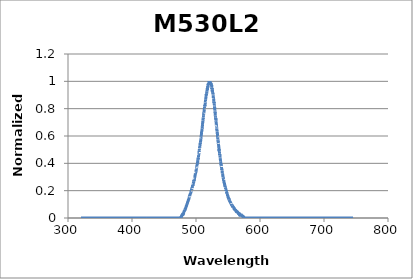
| Category | Normalized Intensity |
|---|---|
| 320.14817633 | 0 |
| 320.25686297 | 0 |
| 320.36555585 | 0 |
| 320.47425497 | 0 |
| 320.58296033 | 0 |
| 320.69167192 | 0 |
| 320.80038974 | 0 |
| 320.9091138 | 0 |
| 321.01784408 | 0 |
| 321.12658059 | 0 |
| 321.23532333 | 0 |
| 321.3440723 | 0 |
| 321.45282748 | 0 |
| 321.56158889 | 0 |
| 321.67035652 | 0 |
| 321.77913037 | 0 |
| 321.88791044 | 0 |
| 321.99669672 | 0 |
| 322.10548922 | 0 |
| 322.21428793 | 0 |
| 322.32309285 | 0 |
| 322.43190398 | 0 |
| 322.54072132 | 0 |
| 322.64954486 | 0 |
| 322.75837461 | 0 |
| 322.86721057 | 0 |
| 322.97605272 | 0 |
| 323.08490108 | 0 |
| 323.19375563 | 0 |
| 323.30261639 | 0 |
| 323.41148333 | 0 |
| 323.52035648 | 0 |
| 323.62923581 | 0 |
| 323.73812134 | 0 |
| 323.84701305 | 0 |
| 323.95591096 | 0 |
| 324.06481505 | 0 |
| 324.17372533 | 0 |
| 324.28264178 | 0 |
| 324.39156443 | 0 |
| 324.50049325 | 0 |
| 324.60942825 | 0 |
| 324.71836943 | 0 |
| 324.82731678 | 0 |
| 324.93627031 | 0 |
| 325.04523001 | 0 |
| 325.15419588 | 0 |
| 325.26316792 | 0 |
| 325.37214613 | 0 |
| 325.48113051 | 0 |
| 325.59012105 | 0 |
| 325.69911775 | 0 |
| 325.80812062 | 0 |
| 325.91712964 | 0 |
| 326.02614483 | 0 |
| 326.13516617 | 0 |
| 326.24419367 | 0 |
| 326.35322732 | 0 |
| 326.46226713 | 0 |
| 326.57131308 | 0 |
| 326.68036519 | 0 |
| 326.78942344 | 0 |
| 326.89848784 | 0 |
| 327.00755839 | 0 |
| 327.11663508 | 0 |
| 327.22571791 | 0 |
| 327.33480688 | 0 |
| 327.44390199 | 0 |
| 327.55300323 | 0 |
| 327.66211061 | 0 |
| 327.77122413 | 0 |
| 327.88034378 | 0 |
| 327.98946956 | 0 |
| 328.09860147 | 0 |
| 328.20773951 | 0 |
| 328.31688367 | 0 |
| 328.42603396 | 0 |
| 328.53519037 | 0 |
| 328.6443529 | 0 |
| 328.75352156 | 0 |
| 328.86269633 | 0 |
| 328.97187722 | 0 |
| 329.08106423 | 0 |
| 329.19025735 | 0 |
| 329.29945658 | 0 |
| 329.40866192 | 0 |
| 329.51787337 | 0 |
| 329.62709093 | 0 |
| 329.7363146 | 0 |
| 329.84554437 | 0 |
| 329.95478025 | 0 |
| 330.06402222 | 0 |
| 330.1732703 | 0 |
| 330.28252448 | 0 |
| 330.39178475 | 0 |
| 330.50105112 | 0 |
| 330.61032358 | 0 |
| 330.71960213 | 0 |
| 330.82888678 | 0 |
| 330.93817751 | 0 |
| 331.04747434 | 0 |
| 331.15677725 | 0 |
| 331.26608624 | 0 |
| 331.37540132 | 0 |
| 331.48472248 | 0 |
| 331.59404972 | 0 |
| 331.70338303 | 0 |
| 331.81272243 | 0 |
| 331.9220679 | 0 |
| 332.03141944 | 0 |
| 332.14077706 | 0 |
| 332.25014075 | 0 |
| 332.3595105 | 0 |
| 332.46888633 | 0 |
| 332.57826822 | 0 |
| 332.68765617 | 0 |
| 332.79705019 | 0 |
| 332.90645027 | 0 |
| 333.01585641 | 0 |
| 333.12526861 | 0 |
| 333.23468687 | 0 |
| 333.34411118 | 0 |
| 333.45354155 | 0 |
| 333.56297796 | 0 |
| 333.67242043 | 0 |
| 333.78186895 | 0 |
| 333.89132352 | 0 |
| 334.00078413 | 0 |
| 334.11025079 | 0 |
| 334.21972349 | 0 |
| 334.32920223 | 0 |
| 334.43868701 | 0 |
| 334.54817783 | 0 |
| 334.65767469 | 0 |
| 334.76717758 | 0 |
| 334.8766865 | 0 |
| 334.98620146 | 0 |
| 335.09572245 | 0 |
| 335.20524947 | 0 |
| 335.31478252 | 0 |
| 335.42432159 | 0 |
| 335.53386669 | 0 |
| 335.64341781 | 0 |
| 335.75297495 | 0 |
| 335.86253811 | 0 |
| 335.97210729 | 0 |
| 336.08168249 | 0 |
| 336.1912637 | 0 |
| 336.30085093 | 0 |
| 336.41044416 | 0 |
| 336.52004341 | 0 |
| 336.62964867 | 0 |
| 336.73925994 | 0 |
| 336.84887721 | 0 |
| 336.95850049 | 0 |
| 337.06812977 | 0 |
| 337.17776505 | 0 |
| 337.28740633 | 0 |
| 337.39705361 | 0 |
| 337.50670688 | 0 |
| 337.61636616 | 0 |
| 337.72603142 | 0 |
| 337.83570268 | 0 |
| 337.94537993 | 0 |
| 338.05506317 | 0 |
| 338.16475239 | 0 |
| 338.2744476 | 0 |
| 338.3841488 | 0 |
| 338.49385598 | 0 |
| 338.60356914 | 0 |
| 338.71328828 | 0 |
| 338.8230134 | 0 |
| 338.93274449 | 0 |
| 339.04248156 | 0 |
| 339.15222461 | 0 |
| 339.26197362 | 0 |
| 339.37172861 | 0 |
| 339.48148957 | 0 |
| 339.59125649 | 0 |
| 339.70102938 | 0 |
| 339.81080823 | 0 |
| 339.92059305 | 0 |
| 340.03038383 | 0 |
| 340.14018057 | 0 |
| 340.24998327 | 0 |
| 340.35979192 | 0 |
| 340.46960653 | 0 |
| 340.57942709 | 0 |
| 340.6892536 | 0 |
| 340.79908607 | 0 |
| 340.90892448 | 0 |
| 341.01876885 | 0 |
| 341.12861915 | 0 |
| 341.2384754 | 0 |
| 341.3483376 | 0 |
| 341.45820574 | 0 |
| 341.56807981 | 0 |
| 341.67795983 | 0 |
| 341.78784578 | 0 |
| 341.89773766 | 0 |
| 342.00763548 | 0 |
| 342.11753924 | 0 |
| 342.22744892 | 0 |
| 342.33736453 | 0 |
| 342.44728607 | 0 |
| 342.55721353 | 0 |
| 342.66714692 | 0 |
| 342.77708623 | 0 |
| 342.88703147 | 0 |
| 342.99698262 | 0 |
| 343.10693969 | 0 |
| 343.21690268 | 0 |
| 343.32687158 | 0 |
| 343.4368464 | 0 |
| 343.54682713 | 0 |
| 343.65681377 | 0 |
| 343.76680631 | 0 |
| 343.87680477 | 0 |
| 343.98680913 | 0 |
| 344.0968194 | 0 |
| 344.20683557 | 0 |
| 344.31685763 | 0 |
| 344.4268856 | 0 |
| 344.53691947 | 0 |
| 344.64695924 | 0 |
| 344.75700489 | 0 |
| 344.86705645 | 0 |
| 344.97711389 | 0 |
| 345.08717723 | 0 |
| 345.19724645 | 0 |
| 345.30732156 | 0 |
| 345.41740256 | 0 |
| 345.52748944 | 0 |
| 345.63758221 | 0 |
| 345.74768085 | 0 |
| 345.85778538 | 0 |
| 345.96789578 | 0 |
| 346.07801206 | 0 |
| 346.18813421 | 0 |
| 346.29826224 | 0 |
| 346.40839614 | 0 |
| 346.51853591 | 0 |
| 346.62868155 | 0 |
| 346.73883306 | 0 |
| 346.84899043 | 0 |
| 346.95915367 | 0 |
| 347.06932277 | 0 |
| 347.17949773 | 0 |
| 347.28967855 | 0 |
| 347.39986522 | 0 |
| 347.51005776 | 0 |
| 347.62025615 | 0 |
| 347.73046039 | 0 |
| 347.84067049 | 0 |
| 347.95088643 | 0 |
| 348.06110823 | 0 |
| 348.17133587 | 0 |
| 348.28156935 | 0 |
| 348.39180868 | 0 |
| 348.50205386 | 0 |
| 348.61230487 | 0 |
| 348.72256173 | 0 |
| 348.83282442 | 0 |
| 348.94309295 | 0 |
| 349.05336731 | 0 |
| 349.16364751 | 0 |
| 349.27393354 | 0 |
| 349.3842254 | 0 |
| 349.49452309 | 0 |
| 349.6048266 | 0 |
| 349.71513594 | 0 |
| 349.82545111 | 0 |
| 349.93577209 | 0 |
| 350.0460989 | 0 |
| 350.15643153 | 0 |
| 350.26676998 | 0 |
| 350.37711424 | 0 |
| 350.48746432 | 0 |
| 350.59782021 | 0 |
| 350.70818191 | 0 |
| 350.81854942 | 0 |
| 350.92892274 | 0 |
| 351.03930187 | 0 |
| 351.14968681 | 0 |
| 351.26007754 | 0 |
| 351.37047409 | 0 |
| 351.48087643 | 0 |
| 351.59128457 | 0 |
| 351.70169851 | 0 |
| 351.81211824 | 0 |
| 351.92254377 | 0 |
| 352.0329751 | 0 |
| 352.14341221 | 0 |
| 352.25385512 | 0 |
| 352.36430381 | 0 |
| 352.47475829 | 0 |
| 352.58521856 | 0 |
| 352.69568461 | 0 |
| 352.80615644 | 0 |
| 352.91663406 | 0 |
| 353.02711745 | 0 |
| 353.13760662 | 0 |
| 353.24810157 | 0 |
| 353.35860229 | 0 |
| 353.46910879 | 0 |
| 353.57962106 | 0 |
| 353.69013909 | 0 |
| 353.8006629 | 0 |
| 353.91119247 | 0 |
| 354.02172781 | 0 |
| 354.13226891 | 0 |
| 354.24281578 | 0 |
| 354.3533684 | 0 |
| 354.46392679 | 0 |
| 354.57449093 | 0 |
| 354.68506083 | 0 |
| 354.79563649 | 0 |
| 354.90621789 | 0 |
| 355.01680505 | 0 |
| 355.12739796 | 0 |
| 355.23799662 | 0 |
| 355.34860102 | 0 |
| 355.45921117 | 0 |
| 355.56982707 | 0 |
| 355.6804487 | 0 |
| 355.79107608 | 0 |
| 355.9017092 | 0 |
| 356.01234805 | 0 |
| 356.12299264 | 0 |
| 356.23364297 | 0 |
| 356.34429902 | 0 |
| 356.45496081 | 0 |
| 356.56562833 | 0 |
| 356.67630158 | 0 |
| 356.78698056 | 0 |
| 356.89766526 | 0 |
| 357.00835568 | 0 |
| 357.11905183 | 0 |
| 357.2297537 | 0 |
| 357.34046128 | 0 |
| 357.45117459 | 0 |
| 357.56189361 | 0 |
| 357.67261835 | 0 |
| 357.78334879 | 0 |
| 357.89408495 | 0 |
| 358.00482682 | 0 |
| 358.1155744 | 0 |
| 358.22632769 | 0 |
| 358.33708668 | 0 |
| 358.44785137 | 0 |
| 358.55862177 | 0 |
| 358.66939787 | 0 |
| 358.78017966 | 0 |
| 358.89096716 | 0 |
| 359.00176035 | 0 |
| 359.11255923 | 0 |
| 359.22336381 | 0 |
| 359.33417408 | 0 |
| 359.44499004 | 0 |
| 359.55581169 | 0 |
| 359.66663902 | 0 |
| 359.77747204 | 0 |
| 359.88831075 | 0 |
| 359.99915513 | 0 |
| 360.1100052 | 0 |
| 360.22086094 | 0 |
| 360.33172237 | 0 |
| 360.44258947 | 0 |
| 360.55346224 | 0 |
| 360.66434069 | 0 |
| 360.77522481 | 0 |
| 360.8861146 | 0 |
| 360.99701005 | 0 |
| 361.10791118 | 0 |
| 361.21881796 | 0 |
| 361.32973042 | 0 |
| 361.44064853 | 0 |
| 361.55157231 | 0 |
| 361.66250174 | 0 |
| 361.77343683 | 0 |
| 361.88437758 | 0 |
| 361.99532398 | 0 |
| 362.10627604 | 0 |
| 362.21723374 | 0 |
| 362.3281971 | 0 |
| 362.43916611 | 0 |
| 362.55014076 | 0 |
| 362.66112105 | 0 |
| 362.77210699 | 0 |
| 362.88309858 | 0 |
| 362.9940958 | 0 |
| 363.10509866 | 0 |
| 363.21610716 | 0 |
| 363.3271213 | 0 |
| 363.43814107 | 0 |
| 363.54916647 | 0 |
| 363.6601975 | 0 |
| 363.77123417 | 0 |
| 363.88227646 | 0 |
| 363.99332438 | 0 |
| 364.10437792 | 0 |
| 364.21543709 | 0 |
| 364.32650188 | 0 |
| 364.43757229 | 0 |
| 364.54864832 | 0 |
| 364.65972997 | 0 |
| 364.77081723 | 0 |
| 364.88191011 | 0 |
| 364.9930086 | 0 |
| 365.1041127 | 0 |
| 365.21522241 | 0 |
| 365.32633773 | 0 |
| 365.43745866 | 0 |
| 365.54858519 | 0 |
| 365.65971732 | 0 |
| 365.77085506 | 0 |
| 365.88199839 | 0 |
| 365.99314733 | 0 |
| 366.10430186 | 0 |
| 366.21546199 | 0 |
| 366.32662772 | 0 |
| 366.43779903 | 0 |
| 366.54897594 | 0 |
| 366.66015844 | 0 |
| 366.77134652 | 0 |
| 366.88254019 | 0 |
| 366.99373945 | 0 |
| 367.10494429 | 0 |
| 367.21615471 | 0 |
| 367.32737072 | 0 |
| 367.4385923 | 0 |
| 367.54981946 | 0 |
| 367.66105219 | 0 |
| 367.7722905 | 0 |
| 367.88353438 | 0 |
| 367.99478384 | 0 |
| 368.10603886 | 0 |
| 368.21729945 | 0 |
| 368.32856561 | 0 |
| 368.43983733 | 0 |
| 368.55111462 | 0 |
| 368.66239746 | 0 |
| 368.77368587 | 0 |
| 368.88497984 | 0 |
| 368.99627936 | 0 |
| 369.10758444 | 0 |
| 369.21889508 | 0 |
| 369.33021127 | 0 |
| 369.441533 | 0 |
| 369.55286029 | 0 |
| 369.66419313 | 0 |
| 369.77553151 | 0 |
| 369.88687544 | 0 |
| 369.99822491 | 0 |
| 370.10957992 | 0 |
| 370.22094047 | 0 |
| 370.33230656 | 0 |
| 370.44367819 | 0 |
| 370.55505536 | 0 |
| 370.66643806 | 0 |
| 370.77782629 | 0 |
| 370.88922005 | 0 |
| 371.00061934 | 0 |
| 371.11202416 | 0 |
| 371.22343451 | 0 |
| 371.33485038 | 0 |
| 371.44627178 | 0 |
| 371.55769869 | 0 |
| 371.66913113 | 0 |
| 371.78056908 | 0 |
| 371.89201256 | 0 |
| 372.00346155 | 0 |
| 372.11491605 | 0 |
| 372.22637606 | 0 |
| 372.33784159 | 0 |
| 372.44931262 | 0 |
| 372.56078917 | 0 |
| 372.67227122 | 0 |
| 372.78375877 | 0 |
| 372.89525183 | 0 |
| 373.00675039 | 0 |
| 373.11825445 | 0 |
| 373.22976401 | 0 |
| 373.34127907 | 0 |
| 373.45279962 | 0 |
| 373.56432566 | 0 |
| 373.6758572 | 0 |
| 373.78739423 | 0 |
| 373.89893675 | 0 |
| 374.01048476 | 0 |
| 374.12203825 | 0 |
| 374.23359723 | 0 |
| 374.34516169 | 0 |
| 374.45673163 | 0 |
| 374.56830705 | 0 |
| 374.67988796 | 0 |
| 374.79147433 | 0 |
| 374.90306619 | 0 |
| 375.01466352 | 0 |
| 375.12626632 | 0 |
| 375.23787459 | 0 |
| 375.34948833 | 0 |
| 375.46110754 | 0 |
| 375.57273221 | 0 |
| 375.68436235 | 0 |
| 375.79599796 | 0 |
| 375.90763902 | 0 |
| 376.01928555 | 0 |
| 376.13093753 | 0 |
| 376.24259497 | 0 |
| 376.35425787 | 0 |
| 376.46592622 | 0 |
| 376.57760002 | 0 |
| 376.68927927 | 0 |
| 376.80096397 | 0 |
| 376.91265413 | 0 |
| 377.02434972 | 0 |
| 377.13605076 | 0 |
| 377.24775725 | 0 |
| 377.35946917 | 0 |
| 377.47118654 | 0 |
| 377.58290935 | 0 |
| 377.69463759 | 0 |
| 377.80637126 | 0 |
| 377.91811038 | 0 |
| 378.02985492 | 0 |
| 378.14160489 | 0 |
| 378.2533603 | 0 |
| 378.36512113 | 0 |
| 378.47688739 | 0 |
| 378.58865907 | 0 |
| 378.70043617 | 0 |
| 378.8122187 | 0 |
| 378.92400665 | 0 |
| 379.03580001 | 0 |
| 379.1475988 | 0 |
| 379.25940299 | 0 |
| 379.37121261 | 0 |
| 379.48302763 | 0 |
| 379.59484806 | 0 |
| 379.70667391 | 0 |
| 379.81850516 | 0 |
| 379.93034182 | 0 |
| 380.04218388 | 0 |
| 380.15403135 | 0 |
| 380.26588421 | 0 |
| 380.37774248 | 0 |
| 380.48960615 | 0 |
| 380.60147521 | 0 |
| 380.71334967 | 0 |
| 380.82522952 | 0 |
| 380.93711476 | 0 |
| 381.0490054 | 0 |
| 381.16090142 | 0 |
| 381.27280283 | 0 |
| 381.38470963 | 0 |
| 381.49662181 | 0 |
| 381.60853938 | 0 |
| 381.72046232 | 0 |
| 381.83239065 | 0 |
| 381.94432436 | 0 |
| 382.05626344 | 0 |
| 382.16820789 | 0 |
| 382.28015772 | 0 |
| 382.39211293 | 0 |
| 382.5040735 | 0 |
| 382.61603944 | 0 |
| 382.72801076 | 0 |
| 382.83998743 | 0 |
| 382.95196947 | 0 |
| 383.06395688 | 0 |
| 383.17594964 | 0 |
| 383.28794777 | 0 |
| 383.39995125 | 0 |
| 383.51196009 | 0 |
| 383.62397429 | 0 |
| 383.73599384 | 0 |
| 383.84801874 | 0 |
| 383.96004899 | 0 |
| 384.07208459 | 0 |
| 384.18412554 | 0 |
| 384.29617184 | 0 |
| 384.40822348 | 0 |
| 384.52028046 | 0 |
| 384.63234278 | 0 |
| 384.74441044 | 0 |
| 384.85648345 | 0 |
| 384.96856178 | 0 |
| 385.08064546 | 0 |
| 385.19273447 | 0 |
| 385.30482881 | 0 |
| 385.41692848 | 0 |
| 385.52903347 | 0 |
| 385.6411438 | 0 |
| 385.75325945 | 0 |
| 385.86538043 | 0 |
| 385.97750673 | 0 |
| 386.08963835 | 0 |
| 386.20177529 | 0 |
| 386.31391755 | 0 |
| 386.42606513 | 0 |
| 386.53821802 | 0 |
| 386.65037622 | 0 |
| 386.76253974 | 0 |
| 386.87470857 | 0 |
| 386.9868827 | 0 |
| 387.09906215 | 0 |
| 387.2112469 | 0 |
| 387.32343695 | 0 |
| 387.43563231 | 0 |
| 387.54783297 | 0 |
| 387.66003892 | 0 |
| 387.77225018 | 0 |
| 387.88446673 | 0 |
| 387.99668858 | 0 |
| 388.10891572 | 0 |
| 388.22114815 | 0 |
| 388.33338588 | 0 |
| 388.44562889 | 0 |
| 388.55787719 | 0 |
| 388.67013078 | 0 |
| 388.78238965 | 0 |
| 388.8946538 | 0 |
| 389.00692323 | 0 |
| 389.11919795 | 0 |
| 389.23147794 | 0 |
| 389.34376321 | 0 |
| 389.45605375 | 0 |
| 389.56834957 | 0 |
| 389.68065066 | 0 |
| 389.79295702 | 0 |
| 389.90526865 | 0 |
| 390.01758554 | 0 |
| 390.1299077 | 0 |
| 390.24223513 | 0 |
| 390.35456782 | 0 |
| 390.46690577 | 0 |
| 390.57924898 | 0 |
| 390.69159745 | 0 |
| 390.80395117 | 0 |
| 390.91631015 | 0 |
| 391.02867438 | 0 |
| 391.14104387 | 0 |
| 391.2534186 | 0 |
| 391.36579858 | 0 |
| 391.47818382 | 0 |
| 391.59057429 | 0 |
| 391.70297001 | 0 |
| 391.81537098 | 0 |
| 391.92777718 | 0 |
| 392.04018863 | 0 |
| 392.15260531 | 0 |
| 392.26502723 | 0 |
| 392.37745438 | 0 |
| 392.48988677 | 0 |
| 392.60232439 | 0 |
| 392.71476724 | 0 |
| 392.82721532 | 0 |
| 392.93966862 | 0 |
| 393.05212715 | 0 |
| 393.16459091 | 0 |
| 393.27705989 | 0 |
| 393.38953408 | 0 |
| 393.5020135 | 0 |
| 393.61449814 | 0 |
| 393.72698799 | 0 |
| 393.83948306 | 0 |
| 393.95198334 | 0 |
| 394.06448883 | 0 |
| 394.17699954 | 0 |
| 394.28951545 | 0 |
| 394.40203657 | 0 |
| 394.51456289 | 0 |
| 394.62709442 | 0 |
| 394.73963116 | 0 |
| 394.85217309 | 0 |
| 394.96472022 | 0 |
| 395.07727255 | 0 |
| 395.18983008 | 0 |
| 395.3023928 | 0 |
| 395.41496071 | 0 |
| 395.52753382 | 0 |
| 395.64011212 | 0 |
| 395.7526956 | 0 |
| 395.86528427 | 0 |
| 395.97787813 | 0 |
| 396.09047717 | 0 |
| 396.2030814 | 0 |
| 396.3156908 | 0 |
| 396.42830539 | 0 |
| 396.54092515 | 0 |
| 396.65355009 | 0 |
| 396.76618021 | 0 |
| 396.87881549 | 0 |
| 396.99145595 | 0 |
| 397.10410158 | 0 |
| 397.21675238 | 0 |
| 397.32940834 | 0 |
| 397.44206947 | 0 |
| 397.55473577 | 0 |
| 397.66740723 | 0 |
| 397.78008384 | 0 |
| 397.89276562 | 0 |
| 398.00545256 | 0 |
| 398.11814465 | 0 |
| 398.23084189 | 0 |
| 398.34354429 | 0 |
| 398.45625184 | 0 |
| 398.56896455 | 0 |
| 398.6816824 | 0 |
| 398.79440539 | 0 |
| 398.90713353 | 0 |
| 399.01986682 | 0 |
| 399.13260525 | 0 |
| 399.24534882 | 0 |
| 399.35809753 | 0 |
| 399.47085137 | 0 |
| 399.58361036 | 0 |
| 399.69637448 | 0 |
| 399.80914373 | 0 |
| 399.92191811 | 0 |
| 400.03469762 | 0 |
| 400.14748226 | 0 |
| 400.26027203 | 0 |
| 400.37306692 | 0 |
| 400.48586694 | 0 |
| 400.59867208 | 0 |
| 400.71148234 | 0 |
| 400.82429772 | 0 |
| 400.93711822 | 0 |
| 401.04994383 | 0 |
| 401.16277456 | 0 |
| 401.2756104 | 0 |
| 401.38845136 | 0 |
| 401.50129742 | 0 |
| 401.61414859 | 0 |
| 401.72700487 | 0 |
| 401.83986625 | 0 |
| 401.95273274 | 0 |
| 402.06560433 | 0 |
| 402.17848102 | 0 |
| 402.29136281 | 0 |
| 402.4042497 | 0 |
| 402.51714169 | 0 |
| 402.63003876 | 0 |
| 402.74294094 | 0 |
| 402.8558482 | 0 |
| 402.96876055 | 0 |
| 403.08167799 | 0 |
| 403.19460052 | 0 |
| 403.30752814 | 0 |
| 403.42046083 | 0 |
| 403.53339861 | 0 |
| 403.64634147 | 0 |
| 403.75928941 | 0 |
| 403.87224243000003 | 0 |
| 403.98520053 | 0 |
| 404.09816369 | 0 |
| 404.21113193 | 0 |
| 404.32410525 | 0 |
| 404.43708363 | 0 |
| 404.55006708 | 0 |
| 404.6630556 | 0 |
| 404.77604918 | 0 |
| 404.88904783 | 0 |
| 405.00205154 | 0 |
| 405.11506031 | 0 |
| 405.22807414 | 0 |
| 405.34109302 | 0 |
| 405.45411697 | 0 |
| 405.56714596 | 0 |
| 405.68018001 | 0 |
| 405.79321911 | 0 |
| 405.90626326 | 0 |
| 406.01931246 | 0 |
| 406.13236671 | 0 |
| 406.245426 | 0 |
| 406.35849034 | 0 |
| 406.47155972 | 0 |
| 406.58463413 | 0 |
| 406.69771359 | 0 |
| 406.81079809 | 0 |
| 406.92388762 | 0 |
| 407.03698218 | 0 |
| 407.15008178 | 0 |
| 407.26318641 | 0 |
| 407.37629607 | 0 |
| 407.48941076 | 0 |
| 407.60253047 | 0 |
| 407.71565521 | 0 |
| 407.82878497 | 0 |
| 407.94191976 | 0 |
| 408.05505956 | 0 |
| 408.16820439 | 0 |
| 408.28135423 | 0 |
| 408.39450909 | 0 |
| 408.50766896 | 0 |
| 408.62083385 | 0 |
| 408.73400375 | 0 |
| 408.84717865 | 0 |
| 408.96035857 | 0 |
| 409.07354349 | 0 |
| 409.18673342 | 0 |
| 409.29992835 | 0 |
| 409.41312828 | 0 |
| 409.52633321 | 0 |
| 409.63954314 | 0 |
| 409.75275807 | 0 |
| 409.865978 | 0 |
| 409.97920292 | 0 |
| 410.09243283 | 0 |
| 410.20566773 | 0 |
| 410.31890763 | 0 |
| 410.43215251 | 0 |
| 410.54540238 | 0 |
| 410.65865723 | 0 |
| 410.77191707 | 0 |
| 410.88518189 | 0 |
| 410.99845169 | 0 |
| 411.11172647 | 0 |
| 411.22500622 | 0 |
| 411.33829095 | 0 |
| 411.45158066 | 0 |
| 411.56487534 | 0 |
| 411.67817499 | 0 |
| 411.79147961 | 0 |
| 411.9047892 | 0 |
| 412.01810375 | 0 |
| 412.13142327 | 0 |
| 412.24474775 | 0 |
| 412.3580772 | 0 |
| 412.4714116 | 0 |
| 412.58475097 | 0 |
| 412.69809529 | 0 |
| 412.81144456 | 0 |
| 412.9247988 | 0 |
| 413.03815798 | 0 |
| 413.15152212 | 0 |
| 413.2648912 | 0 |
| 413.37826523 | 0 |
| 413.49164421 | 0 |
| 413.60502814 | 0 |
| 413.71841701 | 0 |
| 413.83181082 | 0 |
| 413.94520957 | 0 |
| 414.05861326 | 0 |
| 414.17202188 | 0 |
| 414.28543545 | 0 |
| 414.39885394 | 0 |
| 414.51227737 | 0 |
| 414.62570573 | 0 |
| 414.73913902 | 0 |
| 414.85257724 | 0 |
| 414.96602038 | 0 |
| 415.07946845 | 0 |
| 415.19292145 | 0 |
| 415.30637936 | 0 |
| 415.4198422 | 0 |
| 415.53330995 | 0 |
| 415.64678262 | 0 |
| 415.76026021 | 0 |
| 415.87374271 | 0 |
| 415.98723012 | 0 |
| 416.10072245 | 0 |
| 416.21421968 | 0 |
| 416.32772182 | 0 |
| 416.44122887 | 0 |
| 416.55474082 | 0 |
| 416.66825768 | 0 |
| 416.78177944 | 0 |
| 416.8953061 | 0 |
| 417.00883765 | 0 |
| 417.12237411 | 0 |
| 417.23591546 | 0 |
| 417.3494617 | 0 |
| 417.46301284 | 0 |
| 417.57656887 | 0 |
| 417.69012979 | 0 |
| 417.80369559 | 0 |
| 417.91726628 | 0 |
| 418.03084186 | 0 |
| 418.14442232 | 0 |
| 418.25800766 | 0 |
| 418.37159788 | 0 |
| 418.48519298 | 0 |
| 418.59879296 | 0 |
| 418.71239782 | 0 |
| 418.82600754 | 0 |
| 418.93962214 | 0 |
| 419.05324161 | 0 |
| 419.16686595 | 0 |
| 419.28049516 | 0 |
| 419.39412924 | 0 |
| 419.50776818 | 0 |
| 419.62141198 | 0 |
| 419.73506064 | 0 |
| 419.84871417 | 0 |
| 419.96237255 | 0 |
| 420.07603579 | 0 |
| 420.18970389 | 0 |
| 420.30337684 | 0 |
| 420.41705464 | 0 |
| 420.53073729 | 0 |
| 420.6444248 | 0 |
| 420.75811715 | 0 |
| 420.87181434 | 0 |
| 420.98551638 | 0 |
| 421.09922327 | 0 |
| 421.212935 | 0 |
| 421.32665156 | 0 |
| 421.44037297 | 0 |
| 421.55409921 | 0 |
| 421.66783029 | 0 |
| 421.7815662 | 0 |
| 421.89530694 | 0 |
| 422.00905252 | 0 |
| 422.12280292 | 0 |
| 422.23655815 | 0 |
| 422.35031821 | 0 |
| 422.46408309 | 0 |
| 422.5778528 | 0 |
| 422.69162733 | 0 |
| 422.80540667 | 0 |
| 422.91919084 | 0 |
| 423.03297982 | 0 |
| 423.14677362 | 0 |
| 423.26057223 | 0 |
| 423.37437566 | 0 |
| 423.4881839 | 0 |
| 423.60199694 | 0 |
| 423.71581479 | 0 |
| 423.82963745 | 0 |
| 423.94346492 | 0 |
| 424.05729718 | 0 |
| 424.17113425 | 0 |
| 424.28497612 | 0 |
| 424.39882279 | 0 |
| 424.51267425 | 0 |
| 424.62653051 | 0 |
| 424.74039156 | 0 |
| 424.85425741 | 0 |
| 424.96812804 | 0 |
| 425.08200347 | 0 |
| 425.19588368 | 0 |
| 425.30976868 | 0 |
| 425.42365846 | 0 |
| 425.53755303 | 0 |
| 425.65145238 | 0 |
| 425.76535651 | 0 |
| 425.87926541 | 0 |
| 425.9931791 | 0 |
| 426.10709756 | 0 |
| 426.22102079 | 0 |
| 426.33494879 | 0 |
| 426.44888157 | 0 |
| 426.56281911 | 0 |
| 426.67676143 | 0 |
| 426.7907085 | 0 |
| 426.90466035 | 0 |
| 427.01861695 | 0 |
| 427.13257832 | 0 |
| 427.24654445 | 0 |
| 427.36051534 | 0 |
| 427.47449098 | 0 |
| 427.58847138 | 0 |
| 427.70245653 | 0 |
| 427.81644643 | 0 |
| 427.93044109 | 0 |
| 428.04444049 | 0 |
| 428.15844464 | 0 |
| 428.27245354 | 0 |
| 428.38646718 | 0 |
| 428.50048557 | 0 |
| 428.61450869 | 0 |
| 428.72853656 | 0 |
| 428.84256916 | 0 |
| 428.9566065 | 0 |
| 429.07064858 | 0 |
| 429.18469539 | 0 |
| 429.29874693 | 0 |
| 429.41280321 | 0 |
| 429.52686421 | 0 |
| 429.64092994 | 0 |
| 429.75500039 | 0 |
| 429.86907557 | 0 |
| 429.98315548 | 0 |
| 430.0972401 | 0 |
| 430.21132944 | 0 |
| 430.32542351 | 0 |
| 430.43952229 | 0 |
| 430.55362578 | 0 |
| 430.66773399 | 0 |
| 430.78184691 | 0 |
| 430.89596454 | 0 |
| 431.01008688 | 0 |
| 431.12421393 | 0 |
| 431.23834568 | 0 |
| 431.35248214 | 0 |
| 431.4666233 | 0 |
| 431.58076916 | 0 |
| 431.69491972 | 0 |
| 431.80907498 | 0 |
| 431.92323494 | 0 |
| 432.03739959 | 0 |
| 432.15156893 | 0 |
| 432.26574297 | 0 |
| 432.3799217 | 0 |
| 432.49410511 | 0 |
| 432.60829322 | 0 |
| 432.72248601 | 0 |
| 432.83668348 | 0 |
| 432.95088564 | 0 |
| 433.06509248 | 0 |
| 433.179304 | 0 |
| 433.29352019 | 0 |
| 433.40774107 | 0 |
| 433.52196661 | 0 |
| 433.63619684 | 0 |
| 433.75043173 | 0 |
| 433.86467129 | 0 |
| 433.97891553 | 0 |
| 434.09316443 | 0 |
| 434.20741799 | 0 |
| 434.32167622 | 0 |
| 434.43593912 | 0 |
| 434.55020667 | 0 |
| 434.66447889 | 0 |
| 434.77875576 | 0 |
| 434.89303729 | 0 |
| 435.00732347 | 0 |
| 435.12161431 | 0 |
| 435.2359098 | 0 |
| 435.35020994 | 0 |
| 435.46451473 | 0 |
| 435.57882416 | 0 |
| 435.69313824 | 0 |
| 435.80745697 | 0 |
| 435.92178034 | 0 |
| 436.03610835 | 0 |
| 436.150441 | 0 |
| 436.26477829 | 0 |
| 436.37912021 | 0 |
| 436.49346677 | 0 |
| 436.60781796 | 0 |
| 436.72217379 | 0 |
| 436.83653424 | 0 |
| 436.95089932 | 0 |
| 437.06526904 | 0 |
| 437.17964337 | 0 |
| 437.29402233 | 0 |
| 437.40840592 | 0 |
| 437.52279412 | 0 |
| 437.63718695 | 0 |
| 437.75158439 | 0 |
| 437.86598645 | 0 |
| 437.98039312 | 0 |
| 438.09480441 | 0 |
| 438.20922031 | 0 |
| 438.32364082 | 0 |
| 438.43806593 | 0 |
| 438.55249566 | 0 |
| 438.66692999 | 0 |
| 438.78136893 | 0 |
| 438.89581246 | 0 |
| 439.0102606 | 0 |
| 439.12471334 | 0 |
| 439.23917068 | 0 |
| 439.35363261 | 0 |
| 439.46809914 | 0 |
| 439.58257026 | 0 |
| 439.69704597 | 0 |
| 439.81152627 | 0 |
| 439.92601117 | 0 |
| 440.04050065 | 0 |
| 440.15499471 | 0 |
| 440.26949336 | 0 |
| 440.38399659 | 0 |
| 440.4985044 | 0 |
| 440.61301679 | 0 |
| 440.72753376 | 0 |
| 440.84205531 | 0 |
| 440.95658143 | 0 |
| 441.07111213 | 0 |
| 441.18564739 | 0 |
| 441.30018723 | 0 |
| 441.41473163 | 0 |
| 441.5292806 | 0 |
| 441.64383414 | 0 |
| 441.75839224 | 0 |
| 441.87295491 | 0 |
| 441.98752213 | 0 |
| 442.10209392 | 0 |
| 442.21667026 | 0 |
| 442.33125116 | 0 |
| 442.44583661 | 0 |
| 442.56042662 | 0 |
| 442.67502118 | 0 |
| 442.78962029 | 0 |
| 442.90422394 | 0 |
| 443.01883215 | 0 |
| 443.1334449 | 0 |
| 443.24806219 | 0 |
| 443.36268403 | 0 |
| 443.47731041 | 0 |
| 443.59194132 | 0 |
| 443.70657678 | 0 |
| 443.82121677 | 0 |
| 443.93586129 | 0 |
| 444.05051035 | 0 |
| 444.16516394 | 0 |
| 444.27982206 | 0 |
| 444.39448471 | 0 |
| 444.50915189 | 0 |
| 444.62382359 | 0 |
| 444.73849982 | 0 |
| 444.85318056 | 0 |
| 444.96786583 | 0 |
| 445.08255562 | 0 |
| 445.19724993 | 0 |
| 445.31194875 | 0 |
| 445.42665209 | 0 |
| 445.54135994 | 0 |
| 445.6560723 | 0 |
| 445.77078917 | 0 |
| 445.88551055 | 0 |
| 446.00023644 | 0 |
| 446.11496683 | 0 |
| 446.22970173 | 0 |
| 446.34444113 | 0 |
| 446.45918503 | 0 |
| 446.57393342 | 0 |
| 446.68868632 | 0 |
| 446.80344371 | 0 |
| 446.9182056 | 0 |
| 447.03297198 | 0 |
| 447.14774285 | 0 |
| 447.26251822 | 0 |
| 447.37729807 | 0 |
| 447.49208241 | 0 |
| 447.60687123 | 0 |
| 447.72166453 | 0 |
| 447.83646232 | 0 |
| 447.95126459 | 0 |
| 448.06607134 | 0 |
| 448.18088257 | 0 |
| 448.29569827 | 0 |
| 448.41051845 | 0 |
| 448.5253431 | 0 |
| 448.64017222 | 0 |
| 448.75500582 | 0 |
| 448.86984388 | 0 |
| 448.9846864 | 0 |
| 449.0995334 | 0 |
| 449.21438485 | 0 |
| 449.32924077 | 0 |
| 449.44410115 | 0 |
| 449.55896599 | 0 |
| 449.67383529 | 0 |
| 449.78870904 | 0 |
| 449.90358725 | 0 |
| 450.01846991 | 0 |
| 450.13335702 | 0 |
| 450.24824858 | 0 |
| 450.36314459 | 0 |
| 450.47804504 | 0 |
| 450.59294995 | 0 |
| 450.70785929 | 0 |
| 450.82277308 | 0 |
| 450.93769131 | 0 |
| 451.05261398 | 0 |
| 451.16754108 | 0 |
| 451.28247262 | 0 |
| 451.3974086 | 0 |
| 451.51234901 | 0 |
| 451.62729385 | 0 |
| 451.74224312 | 0 |
| 451.85719681 | 0 |
| 451.97215494 | 0 |
| 452.08711749 | 0 |
| 452.20208446 | 0 |
| 452.31705586 | 0 |
| 452.43203168 | 0 |
| 452.54701191 | 0 |
| 452.66199657 | 0 |
| 452.77698563 | 0 |
| 452.89197912 | 0 |
| 453.00697702 | 0 |
| 453.12197932 | 0 |
| 453.23698604 | 0 |
| 453.35199717 | 0 |
| 453.4670127 | 0 |
| 453.58203264 | 0 |
| 453.69705698 | 0 |
| 453.81208572 | 0 |
| 453.92711887 | 0 |
| 454.04215641 | 0 |
| 454.15719835 | 0 |
| 454.27224469 | 0 |
| 454.38729542 | 0 |
| 454.50235054 | 0 |
| 454.61741006 | 0 |
| 454.73247396 | 0 |
| 454.84754226 | 0 |
| 454.96261494 | 0 |
| 455.077692 | 0 |
| 455.19277345 | 0 |
| 455.30785928 | 0 |
| 455.42294949 | 0 |
| 455.53804408 | 0 |
| 455.65314305 | 0 |
| 455.76824639 | 0 |
| 455.88335411 | 0 |
| 455.9984662 | 0 |
| 456.11358267 | 0 |
| 456.2287035 | 0 |
| 456.3438287 | 0 |
| 456.45895826 | 0 |
| 456.5740922 | 0 |
| 456.68923049 | 0 |
| 456.80437315 | 0 |
| 456.91952017 | 0 |
| 457.03467154 | 0 |
| 457.14982728 | 0 |
| 457.26498737 | 0 |
| 457.38015181 | 0 |
| 457.49532061 | 0 |
| 457.61049375 | 0 |
| 457.72567125 | 0 |
| 457.8408531 | 0 |
| 457.95603929 | 0 |
| 458.07122983 | 0 |
| 458.18642471 | 0 |
| 458.30162393 | 0 |
| 458.41682749 | 0 |
| 458.5320354 | 0 |
| 458.64724764 | 0 |
| 458.76246421 | 0 |
| 458.87768512 | 0 |
| 458.99291036 | 0 |
| 459.10813994 | 0 |
| 459.22337384 | 0 |
| 459.33861207 | 0 |
| 459.45385463 | 0 |
| 459.56910151 | 0 |
| 459.68435272 | 0 |
| 459.79960824 | 0 |
| 459.91486809 | 0 |
| 460.03013226 | 0 |
| 460.14540074 | 0 |
| 460.26067354 | 0 |
| 460.37595066 | 0 |
| 460.49123209 | 0 |
| 460.60651782 | 0 |
| 460.72180787 | 0 |
| 460.83710223 | 0 |
| 460.95240089 | 0 |
| 461.06770386 | 0 |
| 461.18301113 | 0 |
| 461.2983227 | 0 |
| 461.41363857 | 0 |
| 461.52895874 | 0 |
| 461.64428321 | 0 |
| 461.75961198 | 0 |
| 461.87494503 | 0 |
| 461.99028239 | 0 |
| 462.10562403 | 0 |
| 462.22096996 | 0 |
| 462.33632018 | 0 |
| 462.45167468 | 0 |
| 462.56703348 | 0 |
| 462.68239655 | 0 |
| 462.79776391 | 0 |
| 462.91313554 | 0 |
| 463.02851146 | 0 |
| 463.14389165 | 0 |
| 463.25927612 | 0 |
| 463.37466486 | 0 |
| 463.49005787 | 0 |
| 463.60545516 | 0 |
| 463.72085671 | 0 |
| 463.83626254 | 0 |
| 463.95167263 | 0 |
| 464.06708698 | 0 |
| 464.1825056 | 0 |
| 464.29792848 | 0 |
| 464.41335562 | 0 |
| 464.52878702 | 0 |
| 464.64422267 | 0 |
| 464.75966258 | 0 |
| 464.87510675 | 0 |
| 464.99055516 | 0 |
| 465.10600783 | 0 |
| 465.22146475 | 0 |
| 465.33692591 | 0 |
| 465.45239133 | 0 |
| 465.56786098 | 0 |
| 465.68333488 | 0 |
| 465.79881303 | 0 |
| 465.91429541 | 0 |
| 466.02978203 | 0 |
| 466.14527288 | 0 |
| 466.26076798 | 0 |
| 466.3762673 | 0 |
| 466.49177086 | 0 |
| 466.60727865 | 0 |
| 466.72279067 | 0 |
| 466.83830692 | 0 |
| 466.9538274 | 0 |
| 467.06935209 | 0 |
| 467.18488102 | 0 |
| 467.30041416 | 0 |
| 467.41595152 | 0 |
| 467.53149311 | 0 |
| 467.6470389 | 0 |
| 467.76258892 | 0 |
| 467.87814315 | 0 |
| 467.99370159 | 0 |
| 468.10926424 | 0 |
| 468.2248311 | 0 |
| 468.34040217 | 0 |
| 468.45597745 | 0 |
| 468.57155693 | 0 |
| 468.68714061 | 0 |
| 468.80272849 | 0 |
| 468.91832058 | 0 |
| 469.03391686 | 0 |
| 469.14951734 | 0 |
| 469.26512202 | 0 |
| 469.38073089 | 0 |
| 469.49634395 | 0 |
| 469.6119612 | 0 |
| 469.72758264 | 0 |
| 469.84320827 | 0 |
| 469.95883809 | 0 |
| 470.07447209 | 0 |
| 470.19011027 | 0 |
| 470.30575264 | 0 |
| 470.42139918 | 0 |
| 470.53704991 | 0 |
| 470.65270481 | 0 |
| 470.76836388 | 0 |
| 470.88402713 | 0 |
| 470.99969455 | 0 |
| 471.11536615 | 0 |
| 471.23104191 | 0 |
| 471.34672184 | 0 |
| 471.46240593 | 0 |
| 471.5780942 | 0 |
| 471.69378662 | 0 |
| 471.8094832 | 0 |
| 471.92518395 | 0 |
| 472.04088885 | 0 |
| 472.15659791 | 0 |
| 472.27231113 | 0 |
| 472.3880285 | 0 |
| 472.50375002 | 0 |
| 472.61947569 | 0 |
| 472.73520551 | 0 |
| 472.85093948 | 0 |
| 472.9666776 | 0 |
| 473.08241986 | 0 |
| 473.19816626 | 0 |
| 473.3139168 | 0 |
| 473.42967149 | 0 |
| 473.54543031 | 0 |
| 473.66119327 | 0 |
| 473.77696036 | 0 |
| 473.89273159 | 0 |
| 474.00850695 | 0 |
| 474.12428644 | 0 |
| 474.24007006 | 0 |
| 474.35585781 | 0 |
| 474.47164969 | 0 |
| 474.58744568 | 0 |
| 474.70324581 | 0 |
| 474.81905005 | 0 |
| 474.93485841 | 0 |
| 475.05067089 | 0 |
| 475.16648749 | 0 |
| 475.2823082 | 0 |
| 475.39813303 | 0 |
| 475.51396197 | 0 |
| 475.62979502 | 0.001 |
| 475.74563218 | 0 |
| 475.86147344 | 0.003 |
| 475.97731881 | 0.002 |
| 476.09316829 | 0.004 |
| 476.20902187 | 0.003 |
| 476.32487955 | 0.004 |
| 476.44074133 | 0.005 |
| 476.55660721 | 0.008 |
| 476.67247718 | 0.007 |
| 476.78835125 | 0.006 |
| 476.90422942 | 0.008 |
| 477.02011167 | 0.014 |
| 477.13599802 | 0.01 |
| 477.25188846 | 0.011 |
| 477.36778298 | 0.011 |
| 477.48368159 | 0.015 |
| 477.59958428 | 0.014 |
| 477.71549106 | 0.016 |
| 477.83140192 | 0.019 |
| 477.94731686 | 0.02 |
| 478.06323587 | 0.02 |
| 478.17915896 | 0.022 |
| 478.29508613 | 0.023 |
| 478.41101737 | 0.021 |
| 478.52695269 | 0.025 |
| 478.64289207 | 0.02 |
| 478.75883552 | 0.024 |
| 478.87478304 | 0.021 |
| 478.99073463 | 0.025 |
| 479.10669028 | 0.025 |
| 479.22264999 | 0.023 |
| 479.33861377 | 0.026 |
| 479.4545816 | 0.02 |
| 479.57055349 | 0.024 |
| 479.68652944 | 0.021 |
| 479.80250945 | 0.034 |
| 479.9184935 | 0.029 |
| 480.03448161 | 0.038 |
| 480.15047377 | 0.027 |
| 480.26646998 | 0.031 |
| 480.38247024 | 0.029 |
| 480.49847454 | 0.039 |
| 480.61448289 | 0.037 |
| 480.73049528 | 0.044 |
| 480.84651171 | 0.046 |
| 480.96253218 | 0.045 |
| 481.07855669 | 0.044 |
| 481.19458523 | 0.045 |
| 481.31061781 | 0.044 |
| 481.42665442 | 0.043 |
| 481.54269507 | 0.043 |
| 481.65873974 | 0.046 |
| 481.77478845 | 0.044 |
| 481.89084118 | 0.049 |
| 482.00689794 | 0.048 |
| 482.12295872 | 0.053 |
| 482.23902352 | 0.058 |
| 482.35509235 | 0.055 |
| 482.4711652 | 0.06 |
| 482.58724206 | 0.056 |
| 482.70332294 | 0.059 |
| 482.81940783 | 0.063 |
| 482.93549674 | 0.062 |
| 483.05158966 | 0.064 |
| 483.16768659 | 0.066 |
| 483.28378753 | 0.065 |
| 483.39989248 | 0.067 |
| 483.51600143 | 0.067 |
| 483.63211439 | 0.07 |
| 483.74823135 | 0.072 |
| 483.86435231 | 0.074 |
| 483.98047727 | 0.076 |
| 484.09660622 | 0.074 |
| 484.21273918 | 0.078 |
| 484.32887613 | 0.078 |
| 484.44501707 | 0.08 |
| 484.56116201 | 0.082 |
| 484.67731093 | 0.086 |
| 484.79346384 | 0.087 |
| 484.90962075 | 0.086 |
| 485.02578163 | 0.087 |
| 485.1419465 | 0.09 |
| 485.25811536 | 0.092 |
| 485.37428819 | 0.092 |
| 485.490465 | 0.096 |
| 485.6066458 | 0.096 |
| 485.72283056 | 0.099 |
| 485.83901931 | 0.099 |
| 485.95521202 | 0.101 |
| 486.07140871 | 0.103 |
| 486.18760937 | 0.104 |
| 486.303814 | 0.105 |
| 486.42002259 | 0.106 |
| 486.53623515 | 0.109 |
| 486.65245168 | 0.11 |
| 486.76867216 | 0.113 |
| 486.88489661 | 0.116 |
| 487.00112502 | 0.117 |
| 487.11735738 | 0.118 |
| 487.2335937 | 0.118 |
| 487.34983398 | 0.119 |
| 487.46607821 | 0.122 |
| 487.58232639 | 0.122 |
| 487.69857852 | 0.125 |
| 487.8148346 | 0.126 |
| 487.93109463 | 0.13 |
| 488.0473586 | 0.13 |
| 488.16362652 | 0.13 |
| 488.27989838 | 0.135 |
| 488.39617418 | 0.134 |
| 488.51245392 | 0.137 |
| 488.6287376 | 0.136 |
| 488.74502521 | 0.139 |
| 488.86131676 | 0.139 |
| 488.97761224 | 0.143 |
| 489.09391165 | 0.145 |
| 489.210215 | 0.145 |
| 489.32652227 | 0.149 |
| 489.44283347 | 0.151 |
| 489.55914859 | 0.156 |
| 489.67546764 | 0.158 |
| 489.79179062 | 0.161 |
| 489.90811751 | 0.16 |
| 490.02444832 | 0.162 |
| 490.14078305 | 0.159 |
| 490.25712169 | 0.164 |
| 490.37346426 | 0.166 |
| 490.48981073 | 0.168 |
| 490.60616111 | 0.17 |
| 490.72251541 | 0.172 |
| 490.83887361 | 0.174 |
| 490.95523573 | 0.176 |
| 491.07160174 | 0.175 |
| 491.18797166 | 0.179 |
| 491.30434549 | 0.18 |
| 491.42072321 | 0.18 |
| 491.53710483 | 0.186 |
| 491.65349035 | 0.183 |
| 491.76987977 | 0.184 |
| 491.88627308 | 0.184 |
| 492.00267029 | 0.187 |
| 492.11907138 | 0.191 |
| 492.23547637 | 0.194 |
| 492.35188524 | 0.199 |
| 492.46829801 | 0.198 |
| 492.58471465 | 0.199 |
| 492.70113519 | 0.201 |
| 492.8175596 | 0.204 |
| 492.93398789 | 0.204 |
| 493.05042007 | 0.205 |
| 493.16685612 | 0.205 |
| 493.28329605 | 0.204 |
| 493.39973985 | 0.211 |
| 493.51618752 | 0.216 |
| 493.63263907 | 0.219 |
| 493.74909449 | 0.217 |
| 493.86555377 | 0.217 |
| 493.98201693 | 0.222 |
| 494.09848394 | 0.223 |
| 494.21495482 | 0.221 |
| 494.33142957 | 0.226 |
| 494.44790817 | 0.231 |
| 494.56439064 | 0.231 |
| 494.68087696 | 0.23 |
| 494.79736714 | 0.238 |
| 494.91386117 | 0.236 |
| 495.03035905 | 0.243 |
| 495.14686079 | 0.239 |
| 495.26336638 | 0.244 |
| 495.37987581 | 0.244 |
| 495.49638909 | 0.247 |
| 495.61290622 | 0.252 |
| 495.72942719 | 0.253 |
| 495.845952 | 0.251 |
| 495.96248066 | 0.255 |
| 496.07901315 | 0.257 |
| 496.19554948 | 0.261 |
| 496.31208965 | 0.26 |
| 496.42863365 | 0.263 |
| 496.54518149 | 0.269 |
| 496.66173315 | 0.268 |
| 496.77828865 | 0.269 |
| 496.89484797 | 0.277 |
| 497.01141112 | 0.271 |
| 497.1279781 | 0.281 |
| 497.2445489 | 0.287 |
| 497.36112352 | 0.286 |
| 497.47770196 | 0.286 |
| 497.59428422 | 0.29 |
| 497.7108703 | 0.29 |
| 497.8274602 | 0.292 |
| 497.94405391 | 0.295 |
| 498.06065143 | 0.297 |
| 498.17725277 | 0.3 |
| 498.29385791 | 0.304 |
| 498.41046686 | 0.31 |
| 498.52707962 | 0.311 |
| 498.64369619 | 0.314 |
| 498.76031656 | 0.314 |
| 498.87694073 | 0.317 |
| 498.9935687 | 0.325 |
| 499.11020047 | 0.323 |
| 499.22683603 | 0.329 |
| 499.3434754 | 0.329 |
| 499.46011856 | 0.33 |
| 499.57676551 | 0.332 |
| 499.69341625 | 0.338 |
| 499.81007078 | 0.336 |
| 499.9267291 | 0.342 |
| 500.04339121 | 0.345 |
| 500.1600571 | 0.346 |
| 500.27672677 | 0.353 |
| 500.39340023 | 0.351 |
| 500.51007747 | 0.353 |
| 500.62675849 | 0.361 |
| 500.74344328 | 0.362 |
| 500.86013185 | 0.365 |
| 500.9768242 | 0.367 |
| 501.09352032 | 0.372 |
| 501.21022021 | 0.375 |
| 501.32692387 | 0.378 |
| 501.44363129 | 0.377 |
| 501.56034249 | 0.383 |
| 501.67705745 | 0.385 |
| 501.79377617 | 0.387 |
| 501.91049865 | 0.388 |
| 502.0272249 | 0.396 |
| 502.1439549 | 0.402 |
| 502.26068866 | 0.406 |
| 502.37742618 | 0.406 |
| 502.49416745 | 0.411 |
| 502.61091248 | 0.407 |
| 502.72766125 | 0.42 |
| 502.84441378 | 0.419 |
| 502.96117005 | 0.43 |
| 503.07793007 | 0.433 |
| 503.19469384 | 0.433 |
| 503.31146135 | 0.429 |
| 503.4282326 | 0.437 |
| 503.54500759 | 0.433 |
| 503.66178632 | 0.442 |
| 503.77856879 | 0.451 |
| 503.89535499 | 0.456 |
| 504.01214493 | 0.455 |
| 504.1289386 | 0.461 |
| 504.245736 | 0.462 |
| 504.36253713 | 0.467 |
| 504.47934199 | 0.469 |
| 504.59615058 | 0.476 |
| 504.71296289 | 0.478 |
| 504.82977892 | 0.484 |
| 504.94659868 | 0.483 |
| 505.06342216 | 0.491 |
| 505.18024935 | 0.494 |
| 505.29708027 | 0.505 |
| 505.41391489 | 0.508 |
| 505.53075324 | 0.509 |
| 505.64759529 | 0.515 |
| 505.76444106 | 0.516 |
| 505.88129054 | 0.514 |
| 505.99814372 | 0.525 |
| 506.11500061 | 0.527 |
| 506.23186121 | 0.531 |
| 506.34872551 | 0.536 |
| 506.46559351 | 0.542 |
| 506.58246521 | 0.548 |
| 506.69934061 | 0.55 |
| 506.81621971 | 0.545 |
| 506.9331025 | 0.553 |
| 507.04998899 | 0.559 |
| 507.16687917 | 0.565 |
| 507.28377304 | 0.561 |
| 507.4006706 | 0.571 |
| 507.51757185 | 0.582 |
| 507.63447679 | 0.586 |
| 507.75138541 | 0.586 |
| 507.86829771 | 0.592 |
| 507.9852137 | 0.599 |
| 508.10213336 | 0.599 |
| 508.21905671 | 0.605 |
| 508.33598373 | 0.607 |
| 508.45291443 | 0.615 |
| 508.5698488 | 0.622 |
| 508.68678684 | 0.627 |
| 508.80372856 | 0.631 |
| 508.92067394 | 0.634 |
| 509.037623 | 0.637 |
| 509.15457572 | 0.638 |
| 509.2715321 | 0.641 |
| 509.38849215 | 0.645 |
| 509.50545586 | 0.65 |
| 509.62242323 | 0.652 |
| 509.73939426 | 0.667 |
| 509.85636894 | 0.673 |
| 509.97334728 | 0.676 |
| 510.09032928 | 0.674 |
| 510.20731492 | 0.682 |
| 510.32430422 | 0.691 |
| 510.44129717 | 0.699 |
| 510.55829377 | 0.703 |
| 510.67529401 | 0.701 |
| 510.7922979 | 0.713 |
| 510.90930543 | 0.713 |
| 511.0263166 | 0.717 |
| 511.14333141 | 0.727 |
| 511.26034986 | 0.725 |
| 511.37737195 | 0.732 |
| 511.49439768 | 0.735 |
| 511.61142703 | 0.746 |
| 511.72846002 | 0.752 |
| 511.84549664 | 0.752 |
| 511.9625369 | 0.76 |
| 512.07958077 | 0.765 |
| 512.19662828 | 0.766 |
| 512.31367941 | 0.774 |
| 512.43073416 | 0.775 |
| 512.54779254 | 0.78 |
| 512.66485453 | 0.782 |
| 512.78192014 | 0.784 |
| 512.89898937 | 0.791 |
| 513.01606222 | 0.797 |
| 513.13313868 | 0.802 |
| 513.25021875 | 0.804 |
| 513.36730244 | 0.804 |
| 513.48438973 | 0.814 |
| 513.60148063 | 0.82 |
| 513.71857514 | 0.823 |
| 513.83567325 | 0.826 |
| 513.95277496 | 0.82 |
| 514.06988028 | 0.823 |
| 514.18698919 | 0.828 |
| 514.30410171 | 0.836 |
| 514.42121782 | 0.845 |
| 514.53833753 | 0.846 |
| 514.65546083 | 0.853 |
| 514.77258772 | 0.855 |
| 514.88971821 | 0.856 |
| 515.00685228 | 0.865 |
| 515.12398994 | 0.872 |
| 515.24113119 | 0.878 |
| 515.35827602 | 0.879 |
| 515.47542444 | 0.882 |
| 515.59257644 | 0.885 |
| 515.70973201 | 0.885 |
| 515.82689117 | 0.891 |
| 515.9440539 | 0.893 |
| 516.06122021 | 0.907 |
| 516.17839009 | 0.901 |
| 516.29556355 | 0.906 |
| 516.41274057 | 0.904 |
| 516.52992117 | 0.912 |
| 516.64710533 | 0.911 |
| 516.76429306 | 0.916 |
| 516.88148435 | 0.914 |
| 516.99867921 | 0.926 |
| 517.11587762 | 0.925 |
| 517.2330796 | 0.938 |
| 517.35028514 | 0.938 |
| 517.46749423 | 0.94 |
| 517.58470688 | 0.941 |
| 517.70192308 | 0.948 |
| 517.81914284 | 0.938 |
| 517.93636614 | 0.945 |
| 518.053593 | 0.944 |
| 518.1708234 | 0.957 |
| 518.28805735 | 0.953 |
| 518.40529484 | 0.966 |
| 518.52253587 | 0.961 |
| 518.63978045 | 0.966 |
| 518.75702857 | 0.969 |
| 518.87428022 | 0.971 |
| 518.99153542 | 0.977 |
| 519.10879414 | 0.981 |
| 519.22605641 | 0.975 |
| 519.3433222 | 0.984 |
| 519.46059152 | 0.982 |
| 519.57786438 | 0.99 |
| 519.69514076 | 0.989 |
| 519.81242067 | 0.986 |
| 519.9297041 | 0.988 |
| 520.04699105 | 0.987 |
| 520.16428153 | 0.991 |
| 520.28157553 | 0.996 |
| 520.39887304 | 1 |
| 520.51617407 | 0.993 |
| 520.63347862 | 0.996 |
| 520.75078668 | 0.994 |
| 520.86809825 | 0.988 |
| 520.98541334 | 0.993 |
| 521.10273193 | 0.99 |
| 521.22005403 | 0.994 |
| 521.33737963 | 0.999 |
| 521.45470874 | 0.996 |
| 521.57204136 | 1 |
| 521.68937747 | 0.997 |
| 521.80671709 | 0.994 |
| 521.9240602 | 0.991 |
| 522.04140681 | 0.984 |
| 522.15875691 | 0.983 |
| 522.27611051 | 0.994 |
| 522.3934676 | 0.989 |
| 522.51082819 | 0.99 |
| 522.62819226 | 0.988 |
| 522.74555981 | 0.986 |
| 522.86293086 | 0.984 |
| 522.98030539 | 0.985 |
| 523.0976834 | 0.979 |
| 523.21506489 | 0.985 |
| 523.33244986 | 0.989 |
| 523.44983831 | 0.982 |
| 523.56723024 | 0.979 |
| 523.68462564 | 0.982 |
| 523.80202452 | 0.975 |
| 523.91942687 | 0.967 |
| 524.03683269 | 0.967 |
| 524.15424197 | 0.97 |
| 524.27165473 | 0.969 |
| 524.38907095 | 0.965 |
| 524.50649064 | 0.97 |
| 524.62391378 | 0.957 |
| 524.74134039 | 0.948 |
| 524.85877046 | 0.951 |
| 524.97620399 | 0.943 |
| 525.09364097 | 0.95 |
| 525.21108141 | 0.947 |
| 525.32852531 | 0.943 |
| 525.44597265 | 0.925 |
| 525.56342345 | 0.938 |
| 525.68087769 | 0.932 |
| 525.79833538 | 0.929 |
| 525.91579652 | 0.918 |
| 526.0332611 | 0.921 |
| 526.15072913 | 0.917 |
| 526.26820059 | 0.915 |
| 526.3856755 | 0.911 |
| 526.50315384 | 0.915 |
| 526.62063562 | 0.904 |
| 526.73812084 | 0.902 |
| 526.85560949 | 0.895 |
| 526.97310157 | 0.879 |
| 527.09059708 | 0.88 |
| 527.20809602 | 0.881 |
| 527.32559839 | 0.875 |
| 527.44310418 | 0.875 |
| 527.5606134 | 0.873 |
| 527.67812604 | 0.87 |
| 527.7956421 | 0.855 |
| 527.91316159 | 0.847 |
| 528.03068449 | 0.849 |
| 528.1482108 | 0.84 |
| 528.26574053 | 0.84 |
| 528.38327368 | 0.847 |
| 528.50081023 | 0.837 |
| 528.6183502 | 0.826 |
| 528.73589358 | 0.824 |
| 528.85344036 | 0.817 |
| 528.97099055 | 0.801 |
| 529.08854414 | 0.813 |
| 529.20610114 | 0.807 |
| 529.32366154 | 0.799 |
| 529.44122533 | 0.788 |
| 529.55879253 | 0.788 |
| 529.67636312 | 0.778 |
| 529.7939371 | 0.771 |
| 529.91151448 | 0.775 |
| 530.02909526 | 0.768 |
| 530.14667942 | 0.752 |
| 530.26426697 | 0.745 |
| 530.38185791 | 0.738 |
| 530.49945223 | 0.741 |
| 530.61704994 | 0.735 |
| 530.73465103 | 0.73 |
| 530.8522555 | 0.72 |
| 530.96986335 | 0.73 |
| 531.08747458 | 0.726 |
| 531.20508919 | 0.712 |
| 531.32270717 | 0.709 |
| 531.44032852 | 0.701 |
| 531.55795325 | 0.694 |
| 531.67558134 | 0.682 |
| 531.79321281 | 0.679 |
| 531.91084764 | 0.68 |
| 532.02848584 | 0.678 |
| 532.1461274 | 0.675 |
| 532.26377232 | 0.666 |
| 532.38142061 | 0.664 |
| 532.49907225 | 0.655 |
| 532.61672725 | 0.643 |
| 532.73438561 | 0.646 |
| 532.85204733 | 0.636 |
| 532.9697124 | 0.634 |
| 533.08738082 | 0.628 |
| 533.20505258 | 0.618 |
| 533.3227277 | 0.623 |
| 533.44040617 | 0.618 |
| 533.55808798 | 0.609 |
| 533.67577313 | 0.602 |
| 533.79346163 | 0.595 |
| 533.91115347 | 0.595 |
| 534.02884865 | 0.587 |
| 534.14654716 | 0.576 |
| 534.26424902 | 0.573 |
| 534.3819542 | 0.567 |
| 534.49966272 | 0.568 |
| 534.61737458 | 0.558 |
| 534.73508976 | 0.561 |
| 534.85280827 | 0.549 |
| 534.97053011 | 0.542 |
| 535.08825527 | 0.539 |
| 535.20598376 | 0.542 |
| 535.32371557 | 0.536 |
| 535.4414507 | 0.52 |
| 535.55918915 | 0.516 |
| 535.67693092 | 0.519 |
| 535.794676 | 0.512 |
| 535.9124244 | 0.503 |
| 536.03017612 | 0.492 |
| 536.14793114 | 0.503 |
| 536.26568948 | 0.494 |
| 536.38345112 | 0.494 |
| 536.50121607 | 0.484 |
| 536.61898432 | 0.484 |
| 536.73675588 | 0.47 |
| 536.85453075 | 0.468 |
| 536.97230891 | 0.46 |
| 537.09009037 | 0.465 |
| 537.20787513 | 0.459 |
| 537.32566319 | 0.457 |
| 537.44345454 | 0.45 |
| 537.56124918 | 0.443 |
| 537.67904712 | 0.442 |
| 537.79684835 | 0.434 |
| 537.91465286 | 0.432 |
| 538.03246066 | 0.433 |
| 538.15027175 | 0.422 |
| 538.26808612 | 0.425 |
| 538.38590377 | 0.415 |
| 538.50372471 | 0.411 |
| 538.62154892 | 0.41 |
| 538.73937641 | 0.405 |
| 538.85720718 | 0.402 |
| 538.97504122 | 0.399 |
| 539.09287854 | 0.39 |
| 539.21071912 | 0.395 |
| 539.32856298 | 0.383 |
| 539.44641011 | 0.385 |
| 539.5642605 | 0.381 |
| 539.68211416 | 0.375 |
| 539.79997108 | 0.371 |
| 539.91783126 | 0.373 |
| 540.03569471 | 0.365 |
| 540.15356141 | 0.36 |
| 540.27143137 | 0.352 |
| 540.38930459 | 0.356 |
| 540.50718106 | 0.348 |
| 540.62506079 | 0.348 |
| 540.74294377 | 0.345 |
| 540.86082999 | 0.342 |
| 540.97871947 | 0.336 |
| 541.09661219 | 0.337 |
| 541.21450816 | 0.326 |
| 541.33240737 | 0.326 |
| 541.45030983 | 0.324 |
| 541.56821552 | 0.322 |
| 541.68612445 | 0.32 |
| 541.80403663 | 0.316 |
| 541.92195203 | 0.311 |
| 542.03987068 | 0.308 |
| 542.15779255 | 0.301 |
| 542.27571766 | 0.303 |
| 542.393646 | 0.298 |
| 542.51157756 | 0.296 |
| 542.62951235 | 0.288 |
| 542.74745037 | 0.291 |
| 542.86539161 | 0.287 |
| 542.98333607 | 0.282 |
| 543.10128376 | 0.278 |
| 543.21923466 | 0.278 |
| 543.33718878 | 0.279 |
| 543.45514612 | 0.279 |
| 543.57310667 | 0.271 |
| 543.69107044 | 0.266 |
| 543.80903741 | 0.264 |
| 543.9270076 | 0.257 |
| 544.04498099 | 0.258 |
| 544.16295759 | 0.254 |
| 544.2809374 | 0.253 |
| 544.39892041 | 0.254 |
| 544.51690662 | 0.253 |
| 544.63489603 | 0.248 |
| 544.75288864 | 0.244 |
| 544.87088445 | 0.241 |
| 544.98888346 | 0.236 |
| 545.10688566 | 0.238 |
| 545.22489105 | 0.236 |
| 545.34289964 | 0.237 |
| 545.46091141 | 0.229 |
| 545.57892637 | 0.23 |
| 545.69694452 | 0.223 |
| 545.81496586 | 0.223 |
| 545.93299037 | 0.219 |
| 546.05101807 | 0.218 |
| 546.16904895 | 0.214 |
| 546.28708301 | 0.217 |
| 546.40512025 | 0.212 |
| 546.52316067 | 0.211 |
| 546.64120425 | 0.209 |
| 546.75925101 | 0.206 |
| 546.87730095 | 0.202 |
| 546.99535405 | 0.206 |
| 547.11341032 | 0.198 |
| 547.23146975 | 0.197 |
| 547.34953236 | 0.196 |
| 547.46759812 | 0.195 |
| 547.58566705 | 0.192 |
| 547.70373914 | 0.191 |
| 547.82181438 | 0.187 |
| 547.93989279 | 0.185 |
| 548.05797435 | 0.184 |
| 548.17605906 | 0.185 |
| 548.29414693 | 0.183 |
| 548.41223795 | 0.181 |
| 548.53033212 | 0.177 |
| 548.64842943 | 0.179 |
| 548.7665299 | 0.178 |
| 548.88463351 | 0.178 |
| 549.00274026 | 0.172 |
| 549.12085015 | 0.171 |
| 549.23896319 | 0.166 |
| 549.35707936 | 0.166 |
| 549.47519867 | 0.162 |
| 549.59332112 | 0.165 |
| 549.7114467 | 0.16 |
| 549.82957541 | 0.157 |
| 549.94770726 | 0.153 |
| 550.06584224 | 0.153 |
| 550.18398034 | 0.151 |
| 550.30212157 | 0.153 |
| 550.42026592 | 0.15 |
| 550.5384134 | 0.151 |
| 550.656564 | 0.148 |
| 550.77471772 | 0.148 |
| 550.89287456 | 0.145 |
| 551.01103452 | 0.141 |
| 551.12919759 | 0.139 |
| 551.24736378 | 0.14 |
| 551.36553308 | 0.142 |
| 551.48370549 | 0.138 |
| 551.60188101 | 0.142 |
| 551.72005964 | 0.135 |
| 551.83824137 | 0.133 |
| 551.95642621 | 0.134 |
| 552.07461416 | 0.129 |
| 552.1928052 | 0.131 |
| 552.31099935 | 0.131 |
| 552.42919659 | 0.127 |
| 552.54739694 | 0.128 |
| 552.66560038 | 0.123 |
| 552.78380691 | 0.125 |
| 552.90201653 | 0.121 |
| 553.02022925 | 0.12 |
| 553.13844505 | 0.119 |
| 553.25666395 | 0.121 |
| 553.37488593 | 0.115 |
| 553.49311099 | 0.119 |
| 553.61133914 | 0.114 |
| 553.72957037 | 0.113 |
| 553.84780468 | 0.11 |
| 553.96604207 | 0.11 |
| 554.08428254 | 0.11 |
| 554.20252608 | 0.109 |
| 554.3207727 | 0.109 |
| 554.43902239 | 0.106 |
| 554.55727515 | 0.106 |
| 554.67553098 | 0.107 |
| 554.79378988 | 0.105 |
| 554.91205184 | 0.105 |
| 555.03031687 | 0.101 |
| 555.14858496 | 0.103 |
| 555.26685612 | 0.1 |
| 555.38513033 | 0.102 |
| 555.50340761 | 0.098 |
| 555.62168794 | 0.097 |
| 555.73997132 | 0.095 |
| 555.85825777 | 0.095 |
| 555.97654726 | 0.095 |
| 556.0948398 | 0.097 |
| 556.2131354 | 0.094 |
| 556.33143404 | 0.09 |
| 556.44973573 | 0.09 |
| 556.56804046 | 0.09 |
| 556.68634824 | 0.086 |
| 556.80465905 | 0.089 |
| 556.92297291 | 0.084 |
| 557.04128981 | 0.088 |
| 557.15960974 | 0.088 |
| 557.27793271 | 0.085 |
| 557.39625872 | 0.083 |
| 557.51458775 | 0.081 |
| 557.63291982 | 0.082 |
| 557.75125492 | 0.084 |
| 557.86959304 | 0.079 |
| 557.98793419 | 0.082 |
| 558.10627837 | 0.077 |
| 558.22462557 | 0.077 |
| 558.34297579 | 0.079 |
| 558.46132903 | 0.076 |
| 558.57968529 | 0.075 |
| 558.69804457 | 0.076 |
| 558.81640686 | 0.074 |
| 558.93477217 | 0.072 |
| 559.05314049 | 0.072 |
| 559.17151182 | 0.071 |
| 559.28988615 | 0.067 |
| 559.4082635 | 0.067 |
| 559.52664386 | 0.069 |
| 559.64502721 | 0.072 |
| 559.76341358 | 0.069 |
| 559.88180294 | 0.071 |
| 560.0001953 | 0.069 |
| 560.11859066 | 0.066 |
| 560.23698902 | 0.063 |
| 560.35539038 | 0.061 |
| 560.47379472 | 0.061 |
| 560.59220207 | 0.064 |
| 560.7106124 | 0.063 |
| 560.82902572 | 0.062 |
| 560.94744203 | 0.063 |
| 561.06586132 | 0.061 |
| 561.1842836 | 0.057 |
| 561.30270887 | 0.062 |
| 561.42113711 | 0.061 |
| 561.53956833 | 0.06 |
| 561.65800254 | 0.058 |
| 561.77643972 | 0.055 |
| 561.89487987 | 0.06 |
| 562.013323 | 0.055 |
| 562.13176911 | 0.052 |
| 562.25021818 | 0.054 |
| 562.36867022 | 0.053 |
| 562.48712523 | 0.051 |
| 562.60558321 | 0.049 |
| 562.72404415 | 0.05 |
| 562.84250805 | 0.057 |
| 562.96097492 | 0.053 |
| 563.07944474 | 0.048 |
| 563.19791753 | 0.048 |
| 563.31639327 | 0.047 |
| 563.43487196 | 0.046 |
| 563.55335361 | 0.044 |
| 563.67183822 | 0.045 |
| 563.79032577 | 0.043 |
| 563.90881627 | 0.045 |
| 564.02730972 | 0.043 |
| 564.14580612 | 0.045 |
| 564.26430546 | 0.043 |
| 564.38280774 | 0.043 |
| 564.50131297 | 0.043 |
| 564.61982114 | 0.044 |
| 564.73833224 | 0.044 |
| 564.85684628 | 0.044 |
| 564.97536326 | 0.045 |
| 565.09388317 | 0.04 |
| 565.21240601 | 0.046 |
| 565.33093178 | 0.037 |
| 565.44946049 | 0.042 |
| 565.56799212 | 0.035 |
| 565.68652667 | 0.038 |
| 565.80506415 | 0.037 |
| 565.92360456 | 0.036 |
| 566.04214788 | 0.036 |
| 566.16069413 | 0.035 |
| 566.27924329 | 0.038 |
| 566.39779537 | 0.034 |
| 566.51635037 | 0.038 |
| 566.63490828 | 0.034 |
| 566.7534691 | 0.038 |
| 566.87203283 | 0.028 |
| 566.99059947 | 0.038 |
| 567.10916902 | 0.027 |
| 567.22774148 | 0.036 |
| 567.34631684 | 0.025 |
| 567.4648951 | 0.038 |
| 567.58347626 | 0.025 |
| 567.70206033 | 0.026 |
| 567.82064729 | 0.022 |
| 567.93923715 | 0.022 |
| 568.0578299 | 0.021 |
| 568.17642555 | 0.023 |
| 568.29502409 | 0.022 |
| 568.41362552 | 0.025 |
| 568.53222984 | 0.021 |
| 568.65083705 | 0.025 |
| 568.76944715 | 0.025 |
| 568.88806012 | 0.023 |
| 569.00667599 | 0.025 |
| 569.12529473 | 0.024 |
| 569.24391635 | 0.024 |
| 569.36254085 | 0.023 |
| 569.48116823 | 0.025 |
| 569.59979848 | 0.02 |
| 569.71843161 | 0.025 |
| 569.83706761 | 0.02 |
| 569.95570647 | 0.025 |
| 570.07434821 | 0.02 |
| 570.19299282 | 0.023 |
| 570.31164029 | 0.02 |
| 570.43029063 | 0.023 |
| 570.54894382 | 0.02 |
| 570.66759988 | 0.023 |
| 570.7862588 | 0.022 |
| 570.90492058 | 0.022 |
| 571.02358522 | 0.021 |
| 571.14225271 | 0.022 |
| 571.26092305 | 0.022 |
| 571.37959625 | 0.021 |
| 571.49827229 | 0.021 |
| 571.61695119 | 0.021 |
| 571.73563293 | 0.021 |
| 571.85431752 | 0.018 |
| 571.97300495 | 0.019 |
| 572.09169523 | 0.018 |
| 572.21038834 | 0.015 |
| 572.3290843 | 0.015 |
| 572.4477831 | 0.015 |
| 572.56648473 | 0.012 |
| 572.68518919 | 0.014 |
| 572.80389649 | 0.011 |
| 572.92260663 | 0.015 |
| 573.04131959 | 0.014 |
| 573.16003538 | 0.011 |
| 573.278754 | 0.01 |
| 573.39747545 | 0.011 |
| 573.51619972 | 0.009 |
| 573.63492681 | 0.008 |
| 573.75365672 | 0.011 |
| 573.87238945 | 0.01 |
| 573.99112501 | 0.009 |
| 574.10986337 | 0.008 |
| 574.22860456 | 0.009 |
| 574.34734855 | 0.009 |
| 574.46609536 | 0.005 |
| 574.58484498 | 0.006 |
| 574.70359741 | 0.005 |
| 574.82235264 | 0.008 |
| 574.94111068 | 0.004 |
| 575.05987153 | 0.004 |
| 575.17863518 | 0.003 |
| 575.29740162 | 0.003 |
| 575.41617087 | 0.003 |
| 575.53494292 | 0.003 |
| 575.65371776 | 0 |
| 575.7724954 | 0 |
| 575.89127583 | 0 |
| 576.01005906 | 0.001 |
| 576.12884507 | 0 |
| 576.24763387 | 0 |
| 576.36642546 | 0 |
| 576.48521984 | 0.001 |
| 576.604017 | 0 |
| 576.72281694 | 0 |
| 576.84161967 | 0 |
| 576.96042517 | 0 |
| 577.07923345 | 0 |
| 577.19804451 | 0 |
| 577.31685834 | 0 |
| 577.43567495 | 0 |
| 577.55449433 | 0 |
| 577.67331648 | 0 |
| 577.7921414 | 0 |
| 577.91096908 | 0 |
| 578.02979953 | 0 |
| 578.14863275 | 0 |
| 578.26746872 | 0 |
| 578.38630746 | 0 |
| 578.50514896 | 0 |
| 578.62399322 | 0 |
| 578.74284023 | 0 |
| 578.86168999 | 0 |
| 578.98054252 | 0 |
| 579.09939779 | 0 |
| 579.21825581 | 0 |
| 579.33711658 | 0 |
| 579.4559801 | 0 |
| 579.57484637 | 0 |
| 579.69371537 | 0 |
| 579.81258712 | 0 |
| 579.93146162 | 0 |
| 580.05033885 | 0 |
| 580.16921882 | 0 |
| 580.28810152 | 0 |
| 580.40698696 | 0 |
| 580.52587514 | 0 |
| 580.64476604 | 0 |
| 580.76365968 | 0 |
| 580.88255605 | 0 |
| 581.00145514 | 0 |
| 581.12035696 | 0 |
| 581.2392615 | 0 |
| 581.35816876 | 0 |
| 581.47707875 | 0 |
| 581.59599145 | 0 |
| 581.71490687 | 0 |
| 581.83382501 | 0 |
| 581.95274587 | 0 |
| 582.07166943 | 0 |
| 582.19059571 | 0 |
| 582.3095247 | 0 |
| 582.4284564 | 0 |
| 582.5473908 | 0 |
| 582.66632791 | 0 |
| 582.78526773 | 0 |
| 582.90421024 | 0 |
| 583.02315546 | 0 |
| 583.14210338 | 0 |
| 583.26105399 | 0 |
| 583.3800073 | 0 |
| 583.49896331 | 0 |
| 583.61792201 | 0 |
| 583.7368834 | 0 |
| 583.85584748 | 0 |
| 583.97481425 | 0 |
| 584.09378371 | 0 |
| 584.21275585 | 0 |
| 584.33173067 | 0 |
| 584.45070818 | 0 |
| 584.56968837 | 0 |
| 584.68867124 | 0 |
| 584.80765679 | 0 |
| 584.92664501 | 0 |
| 585.04563591 | 0 |
| 585.16462948 | 0 |
| 585.28362572 | 0 |
| 585.40262463 | 0 |
| 585.52162621 | 0 |
| 585.64063046 | 0 |
| 585.75963737 | 0 |
| 585.87864695 | 0 |
| 585.99765919 | 0 |
| 586.11667409 | 0 |
| 586.23569165 | 0 |
| 586.35471187 | 0 |
| 586.47373474 | 0 |
| 586.59276027 | 0 |
| 586.71178845 | 0 |
| 586.83081928 | 0 |
| 586.94985277 | 0 |
| 587.0688889 | 0 |
| 587.18792768 | 0 |
| 587.3069691 | 0 |
| 587.42601317 | 0 |
| 587.54505988 | 0 |
| 587.66410923 | 0 |
| 587.78316122 | 0 |
| 587.90221585 | 0 |
| 588.02127311 | 0 |
| 588.14033301 | 0 |
| 588.25939554 | 0 |
| 588.37846071 | 0 |
| 588.4975285 | 0 |
| 588.61659892 | 0 |
| 588.73567197 | 0 |
| 588.85474764 | 0 |
| 588.97382594 | 0 |
| 589.09290686 | 0 |
| 589.2119904 | 0 |
| 589.33107656 | 0 |
| 589.45016534 | 0 |
| 589.56925673 | 0 |
| 589.68835074 | 0 |
| 589.80744736 | 0 |
| 589.92654659 | 0 |
| 590.04564844 | 0 |
| 590.16475289 | 0 |
| 590.28385994 | 0 |
| 590.40296961 | 0 |
| 590.52208187 | 0 |
| 590.64119674 | 0 |
| 590.76031421 | 0 |
| 590.87943428 | 0 |
| 590.99855695 | 0 |
| 591.11768221 | 0 |
| 591.23681007 | 0 |
| 591.35594052 | 0 |
| 591.47507356 | 0 |
| 591.59420919 | 0 |
| 591.71334741 | 0 |
| 591.83248822 | 0 |
| 591.95163161 | 0 |
| 592.07077758 | 0 |
| 592.18992614 | 0 |
| 592.30907728 | 0 |
| 592.428231 | 0 |
| 592.54738729 | 0 |
| 592.66654616 | 0 |
| 592.78570761 | 0 |
| 592.90487163 | 0 |
| 593.02403822 | 0 |
| 593.14320738 | 0 |
| 593.2623791 | 0 |
| 593.3815534 | 0 |
| 593.50073026 | 0 |
| 593.61990968 | 0 |
| 593.73909167 | 0 |
| 593.85827621 | 0 |
| 593.97746332 | 0 |
| 594.09665298 | 0 |
| 594.2158452 | 0 |
| 594.33503997 | 0 |
| 594.4542373 | 0 |
| 594.57343718 | 0 |
| 594.6926396 | 0 |
| 594.81184458 | 0 |
| 594.9310521 | 0 |
| 595.05026217 | 0 |
| 595.16947478 | 0 |
| 595.28868993 | 0 |
| 595.40790762 | 0 |
| 595.52712786 | 0 |
| 595.64635063 | 0 |
| 595.76557593 | 0 |
| 595.88480377 | 0 |
| 596.00403415 | 0 |
| 596.12326705 | 0 |
| 596.24250248 | 0 |
| 596.36174045 | 0 |
| 596.48098093 | 0 |
| 596.60022395 | 0 |
| 596.71946949 | 0 |
| 596.83871754 | 0 |
| 596.95796812 | 0 |
| 597.07722122 | 0 |
| 597.19647684 | 0 |
| 597.31573497 | 0 |
| 597.43499562 | 0 |
| 597.55425878 | 0 |
| 597.67352445 | 0 |
| 597.79279263 | 0 |
| 597.91206332 | 0 |
| 598.03133651 | 0 |
| 598.15061221 | 0 |
| 598.26989041 | 0 |
| 598.38917112 | 0 |
| 598.50845432 | 0 |
| 598.62774003 | 0 |
| 598.74702823 | 0 |
| 598.86631893 | 0 |
| 598.98561212 | 0 |
| 599.10490781 | 0 |
| 599.22420598 | 0 |
| 599.34350665 | 0 |
| 599.4628098 | 0 |
| 599.58211544 | 0 |
| 599.70142357 | 0 |
| 599.82073418 | 0 |
| 599.94004727 | 0 |
| 600.05936284 | 0 |
| 600.17868089 | 0 |
| 600.29800141 | 0 |
| 600.41732442 | 0 |
| 600.53664989 | 0 |
| 600.65597784 | 0 |
| 600.77530826 | 0 |
| 600.89464115 | 0 |
| 601.01397651 | 0 |
| 601.13331434 | 0 |
| 601.25265463 | 0 |
| 601.37199738 | 0 |
| 601.4913426 | 0 |
| 601.61069027 | 0 |
| 601.73004041 | 0 |
| 601.849393 | 0 |
| 601.96874805 | 0 |
| 602.08810555 | 0 |
| 602.2074655 | 0 |
| 602.32682791 | 0 |
| 602.44619276 | 0 |
| 602.56556006 | 0 |
| 602.68492981 | 0 |
| 602.80430201 | 0 |
| 602.92367664 | 0 |
| 603.04305372 | 0 |
| 603.16243324 | 0 |
| 603.2818152 | 0 |
| 603.4011996 | 0 |
| 603.52058643 | 0 |
| 603.63997569 | 0 |
| 603.75936739 | 0 |
| 603.87876152 | 0 |
| 603.99815808 | 0 |
| 604.11755706 | 0 |
| 604.23695848 | 0 |
| 604.35636231 | 0 |
| 604.47576857 | 0 |
| 604.59517726 | 0 |
| 604.71458836 | 0 |
| 604.83400188 | 0 |
| 604.95341782 | 0 |
| 605.07283617 | 0 |
| 605.19225694 | 0 |
| 605.31168012 | 0 |
| 605.43110572 | 0 |
| 605.55053372 | 0 |
| 605.66996413 | 0 |
| 605.78939694 | 0 |
| 605.90883216 | 0 |
| 606.02826979 | 0 |
| 606.14770981 | 0 |
| 606.26715224 | 0 |
| 606.38659706 | 0 |
| 606.50604428 | 0 |
| 606.6254939 | 0 |
| 606.74494591 | 0 |
| 606.86440031 | 0 |
| 606.98385711 | 0 |
| 607.10331629 | 0 |
| 607.22277786 | 0 |
| 607.34224182 | 0 |
| 607.46170816 | 0 |
| 607.58117689 | 0 |
| 607.70064799 | 0 |
| 607.82012148 | 0 |
| 607.93959735 | 0 |
| 608.05907559 | 0 |
| 608.17855621 | 0 |
| 608.2980392 | 0 |
| 608.41752457 | 0 |
| 608.5370123 | 0 |
| 608.65650241 | 0 |
| 608.77599488 | 0 |
| 608.89548972 | 0 |
| 609.01498692 | 0 |
| 609.13448649 | 0 |
| 609.25398842 | 0 |
| 609.37349271 | 0 |
| 609.49299935 | 0 |
| 609.61250836 | 0 |
| 609.73201972 | 0 |
| 609.85153343 | 0 |
| 609.9710495 | 0 |
| 610.09056791 | 0 |
| 610.21008868 | 0 |
| 610.32961179 | 0 |
| 610.44913725 | 0 |
| 610.56866506 | 0 |
| 610.68819521 | 0 |
| 610.8077277 | 0 |
| 610.92726253 | 0 |
| 611.04679969 | 0 |
| 611.1663392 | 0 |
| 611.28588104 | 0 |
| 611.40542521 | 0 |
| 611.52497172 | 0 |
| 611.64452056 | 0 |
| 611.76407172 | 0 |
| 611.88362522 | 0 |
| 612.00318104 | 0 |
| 612.12273918 | 0 |
| 612.24229965 | 0 |
| 612.36186244 | 0 |
| 612.48142755 | 0 |
| 612.60099498 | 0 |
| 612.72056472 | 0 |
| 612.84013678 | 0 |
| 612.95971116 | 0 |
| 613.07928784 | 0 |
| 613.19886684 | 0 |
| 613.31844815 | 0 |
| 613.43803176 | 0 |
| 613.55761768 | 0 |
| 613.6772059 | 0 |
| 613.79679643 | 0 |
| 613.91638926 | 0 |
| 614.03598439 | 0 |
| 614.15558182 | 0 |
| 614.27518154 | 0 |
| 614.39478356 | 0 |
| 614.51438787 | 0 |
| 614.63399448 | 0 |
| 614.75360337 | 0 |
| 614.87321456 | 0 |
| 614.99282803 | 0 |
| 615.11244379 | 0 |
| 615.23206183 | 0 |
| 615.35168216 | 0 |
| 615.47130477 | 0 |
| 615.59092966 | 0 |
| 615.71055682 | 0 |
| 615.83018626 | 0 |
| 615.94981798 | 0 |
| 616.06945197 | 0 |
| 616.18908824 | 0 |
| 616.30872677 | 0 |
| 616.42836758 | 0 |
| 616.54801065 | 0 |
| 616.66765598 | 0 |
| 616.78730358 | 0 |
| 616.90695345 | 0 |
| 617.02660557 | 0 |
| 617.14625996 | 0 |
| 617.2659166 | 0 |
| 617.38557551 | 0 |
| 617.50523666 | 0 |
| 617.62490007 | 0 |
| 617.74456573 | 0 |
| 617.86423364 | 0 |
| 617.98390381 | 0 |
| 618.10357621 | 0 |
| 618.22325087 | 0 |
| 618.34292777 | 0 |
| 618.46260691 | 0 |
| 618.58228829 | 0 |
| 618.70197192 | 0 |
| 618.82165778 | 0 |
| 618.94134588 | 0 |
| 619.06103621 | 0 |
| 619.18072878 | 0 |
| 619.30042357 | 0 |
| 619.4201206 | 0 |
| 619.53981986 | 0 |
| 619.65952135 | 0 |
| 619.77922506 | 0 |
| 619.898931 | 0 |
| 620.01863915 | 0 |
| 620.13834953 | 0 |
| 620.25806213 | 0 |
| 620.37777695 | 0 |
| 620.49749399 | 0 |
| 620.61721324 | 0 |
| 620.7369347 | 0 |
| 620.85665837 | 0 |
| 620.97638426 | 0 |
| 621.09611236 | 0 |
| 621.21584266 | 0 |
| 621.33557517 | 0 |
| 621.45530988 | 0 |
| 621.57504679 | 0 |
| 621.69478591 | 0 |
| 621.81452723 | 0 |
| 621.93427074 | 0 |
| 622.05401645 | 0 |
| 622.17376436 | 0 |
| 622.29351445 | 0 |
| 622.41326675 | 0 |
| 622.53302123 | 0 |
| 622.6527779 | 0 |
| 622.77253676 | 0 |
| 622.8922978 | 0 |
| 623.01206103 | 0 |
| 623.13182644 | 0 |
| 623.25159403 | 0 |
| 623.3713638 | 0 |
| 623.49113575 | 0 |
| 623.61090988 | 0 |
| 623.73068618 | 0 |
| 623.85046465 | 0 |
| 623.9702453 | 0 |
| 624.09002812 | 0 |
| 624.2098131 | 0 |
| 624.32960025 | 0 |
| 624.44938957 | 0 |
| 624.56918106 | 0 |
| 624.6889747 | 0 |
| 624.80877051 | 0 |
| 624.92856847 | 0 |
| 625.0483686 | 0 |
| 625.16817088 | 0 |
| 625.28797531 | 0 |
| 625.4077819 | 0 |
| 625.52759064 | 0 |
| 625.64740154 | 0 |
| 625.76721458 | 0 |
| 625.88702976 | 0 |
| 626.0068471 | 0 |
| 626.12666657 | 0 |
| 626.24648819 | 0 |
| 626.36631195 | 0 |
| 626.48613785 | 0 |
| 626.60596589 | 0 |
| 626.72579607 | 0 |
| 626.84562838 | 0 |
| 626.96546282 | 0 |
| 627.0852994 | 0 |
| 627.2051381 | 0 |
| 627.32497893 | 0 |
| 627.4448219 | 0 |
| 627.56466698 | 0 |
| 627.68451419 | 0 |
| 627.80436353 | 0 |
| 627.92421498 | 0 |
| 628.04406855 | 0 |
| 628.16392425 | 0 |
| 628.28378205 | 0 |
| 628.40364198 | 0 |
| 628.52350401 | 0 |
| 628.64336816 | 0 |
| 628.76323442 | 0 |
| 628.88310279 | 0 |
| 629.00297326 | 0 |
| 629.12284584 | 0 |
| 629.24272053 | 0 |
| 629.36259731 | 0 |
| 629.4824762 | 0 |
| 629.60235719 | 0 |
| 629.72224027 | 0 |
| 629.84212545 | 0 |
| 629.96201273 | 0 |
| 630.0819021 | 0 |
| 630.20179356 | 0 |
| 630.32168711 | 0 |
| 630.44158275 | 0 |
| 630.56148047 | 0 |
| 630.68138029 | 0 |
| 630.80128218 | 0 |
| 630.92118616 | 0 |
| 631.04109222 | 0 |
| 631.16100036 | 0 |
| 631.28091058 | 0 |
| 631.40082287 | 0 |
| 631.52073724 | 0 |
| 631.64065368 | 0 |
| 631.76057219 | 0 |
| 631.88049277 | 0 |
| 632.00041543 | 0 |
| 632.12034014 | 0 |
| 632.24026693 | 0 |
| 632.36019578 | 0 |
| 632.48012669 | 0 |
| 632.60005966 | 0 |
| 632.71999469 | 0 |
| 632.83993178 | 0 |
| 632.95987092 | 0 |
| 633.07981212 | 0 |
| 633.19975537 | 0 |
| 633.31970068 | 0 |
| 633.43964803 | 0 |
| 633.55959743 | 0 |
| 633.67954888 | 0 |
| 633.79950238 | 0 |
| 633.91945792 | 0 |
| 634.0394155 | 0 |
| 634.15937512 | 0 |
| 634.27933678 | 0 |
| 634.39930048 | 0 |
| 634.51926622 | 0 |
| 634.63923399 | 0 |
| 634.75920379 | 0 |
| 634.87917562 | 0 |
| 634.99914949 | 0 |
| 635.11912538 | 0 |
| 635.2391033 | 0 |
| 635.35908325 | 0 |
| 635.47906522 | 0 |
| 635.59904921 | 0 |
| 635.71903522 | 0 |
| 635.83902325 | 0 |
| 635.9590133 | 0 |
| 636.07900537 | 0 |
| 636.19899945 | 0 |
| 636.31899554 | 0 |
| 636.43899365 | 0 |
| 636.55899376 | 0 |
| 636.67899588 | 0 |
| 636.79900001 | 0 |
| 636.91900615 | 0 |
| 637.03901429 | 0 |
| 637.15902443 | 0 |
| 637.27903657 | 0 |
| 637.39905071 | 0 |
| 637.51906685 | 0 |
| 637.63908499 | 0 |
| 637.75910512 | 0 |
| 637.87912724 | 0 |
| 637.99915135 | 0 |
| 638.11917746 | 0 |
| 638.23920555 | 0 |
| 638.35923563 | 0 |
| 638.47926769 | 0 |
| 638.59930174 | 0 |
| 638.71933777 | 0 |
| 638.83937578 | 0 |
| 638.95941577 | 0 |
| 639.07945774 | 0 |
| 639.19950169 | 0 |
| 639.3195476 | 0 |
| 639.4395955 | 0 |
| 639.55964536 | 0 |
| 639.67969719 | 0 |
| 639.79975099 | 0 |
| 639.91980676 | 0 |
| 640.03986449 | 0 |
| 640.15992419 | 0 |
| 640.27998585 | 0 |
| 640.40004947 | 0 |
| 640.52011505 | 0 |
| 640.64018258 | 0 |
| 640.76025207 | 0 |
| 640.88032352 | 0 |
| 641.00039692 | 0 |
| 641.12047227 | 0 |
| 641.24054957 | 0 |
| 641.36062882 | 0 |
| 641.48071002 | 0 |
| 641.60079316 | 0 |
| 641.72087824 | 0 |
| 641.84096527 | 0 |
| 641.96105424 | 0 |
| 642.08114514 | 0 |
| 642.20123799 | 0 |
| 642.32133276 | 0 |
| 642.44142948 | 0 |
| 642.56152813 | 0 |
| 642.6816287 | 0 |
| 642.80173121 | 0 |
| 642.92183565 | 0 |
| 643.04194201 | 0 |
| 643.1620503 | 0 |
| 643.28216051 | 0 |
| 643.40227264 | 0 |
| 643.5223867 | 0 |
| 643.64250267 | 0 |
| 643.76262056 | 0 |
| 643.88274037 | 0 |
| 644.00286209 | 0 |
| 644.12298572 | 0 |
| 644.24311127 | 0 |
| 644.36323872 | 0 |
| 644.48336809 | 0 |
| 644.60349936 | 0 |
| 644.72363253 | 0 |
| 644.84376761 | 0 |
| 644.96390459 | 0 |
| 645.08404347 | 0 |
| 645.20418425 | 0 |
| 645.32432693 | 0 |
| 645.4444715 | 0 |
| 645.56461797 | 0 |
| 645.68476633 | 0 |
| 645.80491658 | 0 |
| 645.92506872 | 0 |
| 646.04522275 | 0 |
| 646.16537866 | 0 |
| 646.28553646 | 0 |
| 646.40569615 | 0 |
| 646.52585771 | 0 |
| 646.64602116 | 0 |
| 646.76618648 | 0 |
| 646.88635369 | 0 |
| 647.00652276 | 0 |
| 647.12669372 | 0 |
| 647.24686654 | 0 |
| 647.36704124 | 0 |
| 647.48721781 | 0 |
| 647.60739624 | 0 |
| 647.72757654 | 0 |
| 647.84775871 | 0 |
| 647.96794274 | 0 |
| 648.08812863 | 0 |
| 648.20831638 | 0 |
| 648.32850599 | 0 |
| 648.44869746 | 0 |
| 648.56889078 | 0 |
| 648.68908596 | 0 |
| 648.80928299 | 0 |
| 648.92948187 | 0 |
| 649.0496826 | 0 |
| 649.16988518 | 0 |
| 649.2900896 | 0 |
| 649.41029587 | 0 |
| 649.53050399 | 0 |
| 649.65071394 | 0 |
| 649.77092574 | 0 |
| 649.89113937 | 0 |
| 650.01135485 | 0 |
| 650.13157215 | 0 |
| 650.2517913 | 0 |
| 650.37201227 | 0 |
| 650.49223507 | 0 |
| 650.61245971 | 0 |
| 650.73268617 | 0 |
| 650.85291446 | 0 |
| 650.97314458 | 0 |
| 651.09337651 | 0 |
| 651.21361027 | 0 |
| 651.33384585 | 0 |
| 651.45408325 | 0 |
| 651.57432247 | 0 |
| 651.6945635 | 0 |
| 651.81480634 | 0 |
| 651.935051 | 0 |
| 652.05529747 | 0 |
| 652.17554575 | 0 |
| 652.29579584 | 0 |
| 652.41604773 | 0 |
| 652.53630143 | 0 |
| 652.65655693 | 0 |
| 652.77681423 | 0 |
| 652.89707333 | 0 |
| 653.01733423 | 0 |
| 653.13759693 | 0 |
| 653.25786143 | 0 |
| 653.37812772 | 0 |
| 653.4983958 | 0 |
| 653.61866567 | 0 |
| 653.73893733 | 0 |
| 653.85921078 | 0 |
| 653.97948601 | 0 |
| 654.09976303 | 0 |
| 654.22004184 | 0 |
| 654.34032242 | 0 |
| 654.46060479 | 0 |
| 654.58088893 | 0 |
| 654.70117485 | 0 |
| 654.82146255 | 0 |
| 654.94175202 | 0 |
| 655.06204326 | 0 |
| 655.18233628 | 0 |
| 655.30263106 | 0 |
| 655.42292761 | 0 |
| 655.54322593 | 0 |
| 655.66352601 | 0 |
| 655.78382786 | 0 |
| 655.90413146 | 0 |
| 656.02443683 | 0 |
| 656.14474396 | 0 |
| 656.26505284 | 0 |
| 656.38536348 | 0 |
| 656.50567587 | 0 |
| 656.62599001 | 0 |
| 656.74630591 | 0 |
| 656.86662356 | 0 |
| 656.98694295 | 0 |
| 657.10726409 | 0 |
| 657.22758697 | 0 |
| 657.3479116 | 0 |
| 657.46823797 | 0 |
| 657.58856607 | 0 |
| 657.70889592 | 0 |
| 657.8292275 | 0 |
| 657.94956082 | 0 |
| 658.06989588 | 0 |
| 658.19023266 | 0 |
| 658.31057118 | 0 |
| 658.43091142 | 0 |
| 658.5512534 | 0 |
| 658.6715971 | 0 |
| 658.79194252 | 0 |
| 658.91228967 | 0 |
| 659.03263854 | 0 |
| 659.15298913 | 0 |
| 659.27334143 | 0 |
| 659.39369546 | 0 |
| 659.5140512 | 0 |
| 659.63440865 | 0 |
| 659.75476782 | 0 |
| 659.87512869 | 0 |
| 659.99549128 | 0 |
| 660.11585557 | 0 |
| 660.23622157 | 0 |
| 660.35658928 | 0 |
| 660.47695869 | 0 |
| 660.59732979 | 0 |
| 660.7177026 | 0 |
| 660.83807711 | 0 |
| 660.95845331 | 0 |
| 661.07883121 | 0 |
| 661.19921081 | 0 |
| 661.31959209 | 0 |
| 661.43997507 | 0 |
| 661.56035973 | 0 |
| 661.68074609 | 0 |
| 661.80113413 | 0 |
| 661.92152385 | 0 |
| 662.04191526 | 0 |
| 662.16230834 | 0 |
| 662.28270311 | 0 |
| 662.40309956 | 0 |
| 662.52349768 | 0 |
| 662.64389748 | 0 |
| 662.76429895 | 0 |
| 662.8847021 | 0 |
| 663.00510691 | 0 |
| 663.1255134 | 0 |
| 663.24592155 | 0 |
| 663.36633137 | 0 |
| 663.48674285 | 0 |
| 663.60715599 | 0 |
| 663.7275708 | 0 |
| 663.84798727 | 0 |
| 663.96840539 | 0 |
| 664.08882517 | 0 |
| 664.20924661 | 0 |
| 664.3296697 | 0 |
| 664.45009445 | 0 |
| 664.57052084 | 0 |
| 664.69094888 | 0 |
| 664.81137857 | 0 |
| 664.93180991 | 0 |
| 665.05224289 | 0 |
| 665.17267751 | 0 |
| 665.29311378 | 0 |
| 665.41355168 | 0 |
| 665.53399122 | 0 |
| 665.6544324 | 0 |
| 665.77487522 | 0 |
| 665.89531967 | 0 |
| 666.01576575 | 0 |
| 666.13621346 | 0 |
| 666.2566628 | 0 |
| 666.37711377 | 0 |
| 666.49756636 | 0 |
| 666.61802058 | 0 |
| 666.73847642 | 0 |
| 666.85893388 | 0 |
| 666.97939296 | 0 |
| 667.09985366 | 0 |
| 667.22031598 | 0 |
| 667.34077991 | 0 |
| 667.46124546 | 0 |
| 667.58171261 | 0 |
| 667.70218138 | 0 |
| 667.82265176 | 0 |
| 667.94312374 | 0 |
| 668.06359733 | 0 |
| 668.18407253 | 0 |
| 668.30454933 | 0 |
| 668.42502772 | 0 |
| 668.54550772 | 0 |
| 668.66598932 | 0 |
| 668.78647251 | 0 |
| 668.9069573 | 0 |
| 669.02744368 | 0 |
| 669.14793166 | 0 |
| 669.26842122 | 0 |
| 669.38891237 | 0 |
| 669.50940511 | 0 |
| 669.62989944 | 0 |
| 669.75039535 | 0 |
| 669.87089285 | 0 |
| 669.99139192 | 0 |
| 670.11189257 | 0 |
| 670.23239481 | 0 |
| 670.35289862 | 0 |
| 670.473404 | 0 |
| 670.59391096 | 0 |
| 670.71441949 | 0 |
| 670.83492959 | 0 |
| 670.95544126 | 0 |
| 671.07595449 | 0 |
| 671.1964693 | 0 |
| 671.31698566 | 0 |
| 671.43750359 | 0 |
| 671.55802308 | 0 |
| 671.67854413 | 0 |
| 671.79906674 | 0 |
| 671.9195909 | 0 |
| 672.04011662 | 0 |
| 672.1606439 | 0 |
| 672.28117272 | 0 |
| 672.40170309 | 0 |
| 672.52223502 | 0 |
| 672.64276849 | 0 |
| 672.76330351 | 0 |
| 672.88384007 | 0 |
| 673.00437817 | 0 |
| 673.12491782 | 0 |
| 673.245459 | 0 |
| 673.36600172 | 0 |
| 673.48654598 | 0 |
| 673.60709178 | 0 |
| 673.7276391 | 0 |
| 673.84818796 | 0 |
| 673.96873835 | 0 |
| 674.08929027 | 0 |
| 674.20984372 | 0 |
| 674.33039869 | 0 |
| 674.45095518 | 0 |
| 674.5715132 | 0 |
| 674.69207274 | 0 |
| 674.8126338 | 0 |
| 674.93319637 | 0 |
| 675.05376047 | 0 |
| 675.17432607 | 0 |
| 675.2948932 | 0 |
| 675.41546183 | 0 |
| 675.53603197 | 0 |
| 675.65660362 | 0 |
| 675.77717678 | 0 |
| 675.89775145 | 0 |
| 676.01832762 | 0 |
| 676.13890529 | 0 |
| 676.25948446 | 0 |
| 676.38006513 | 0 |
| 676.5006473 | 0 |
| 676.62123097 | 0 |
| 676.74181613 | 0 |
| 676.86240278 | 0 |
| 676.98299093 | 0 |
| 677.10358057 | 0 |
| 677.22417169 | 0 |
| 677.3447643 | 0 |
| 677.4653584 | 0 |
| 677.58595398 | 0 |
| 677.70655105 | 0 |
| 677.82714959 | 0 |
| 677.94774962 | 0 |
| 678.06835112 | 0 |
| 678.1889541 | 0 |
| 678.30955855 | 0 |
| 678.43016448 | 0 |
| 678.55077188 | 0 |
| 678.67138074 | 0 |
| 678.79199108 | 0 |
| 678.91260289 | 0 |
| 679.03321616 | 0 |
| 679.15383089 | 0 |
| 679.27444709 | 0 |
| 679.39506474 | 0 |
| 679.51568386 | 0 |
| 679.63630443 | 0 |
| 679.75692647 | 0 |
| 679.87754995 | 0 |
| 679.99817489 | 0 |
| 680.11880128 | 0 |
| 680.23942912 | 0 |
| 680.36005841 | 0 |
| 680.48068915 | 0 |
| 680.60132133 | 0 |
| 680.72195495 | 0 |
| 680.84259002 | 0 |
| 680.96322653 | 0 |
| 681.08386448 | 0 |
| 681.20450386 | 0 |
| 681.32514469 | 0 |
| 681.44578694 | 0 |
| 681.56643063 | 0 |
| 681.68707575 | 0 |
| 681.8077223 | 0 |
| 681.92837028 | 0 |
| 682.04901969 | 0 |
| 682.16967052 | 0 |
| 682.29032278 | 0 |
| 682.41097646 | 0 |
| 682.53163156 | 0 |
| 682.65228808 | 0 |
| 682.77294601 | 0 |
| 682.89360537 | 0 |
| 683.01426613 | 0 |
| 683.13492832 | 0 |
| 683.25559191 | 0 |
| 683.37625691 | 0 |
| 683.49692332 | 0 |
| 683.61759114 | 0 |
| 683.73826036 | 0 |
| 683.85893099 | 0 |
| 683.97960302 | 0 |
| 684.10027645 | 0 |
| 684.22095127 | 0 |
| 684.3416275 | 0 |
| 684.46230512 | 0 |
| 684.58298414 | 0 |
| 684.70366455 | 0 |
| 684.82434635 | 0 |
| 684.94502954 | 0 |
| 685.06571413 | 0 |
| 685.18640009 | 0 |
| 685.30708744 | 0 |
| 685.42777618 | 0 |
| 685.5484663 | 0 |
| 685.6691578 | 0 |
| 685.78985068 | 0 |
| 685.91054493 | 0 |
| 686.03124057 | 0 |
| 686.15193757 | 0 |
| 686.27263595 | 0 |
| 686.3933357 | 0 |
| 686.51403682 | 0 |
| 686.63473931 | 0 |
| 686.75544317 | 0 |
| 686.87614839 | 0 |
| 686.99685498 | 0 |
| 687.11756292 | 0 |
| 687.23827223 | 0 |
| 687.3589829 | 0 |
| 687.47969492 | 0 |
| 687.6004083 | 0 |
| 687.72112304 | 0 |
| 687.84183913 | 0 |
| 687.96255657 | 0 |
| 688.08327536 | 0 |
| 688.2039955 | 0 |
| 688.32471698 | 0 |
| 688.44543981 | 0 |
| 688.56616398 | 0 |
| 688.6868895 | 0 |
| 688.80761636 | 0 |
| 688.92834455 | 0 |
| 689.04907408 | 0 |
| 689.16980495 | 0 |
| 689.29053716 | 0 |
| 689.41127069 | 0 |
| 689.53200556 | 0 |
| 689.65274176 | 0 |
| 689.77347928 | 0 |
| 689.89421813 | 0 |
| 690.01495831 | 0 |
| 690.13569981 | 0 |
| 690.25644264 | 0 |
| 690.37718678 | 0 |
| 690.49793224 | 0 |
| 690.61867902 | 0 |
| 690.73942712 | 0 |
| 690.86017653 | 0 |
| 690.98092725 | 0 |
| 691.10167929 | 0 |
| 691.22243263 | 0 |
| 691.34318729 | 0 |
| 691.46394325 | 0 |
| 691.58470051 | 0 |
| 691.70545908 | 0 |
| 691.82621895 | 0 |
| 691.94698012 | 0 |
| 692.06774259 | 0 |
| 692.18850636 | 0 |
| 692.30927142 | 0 |
| 692.43003778 | 0 |
| 692.55080543 | 0 |
| 692.67157437 | 0 |
| 692.7923446 | 0 |
| 692.91311612 | 0 |
| 693.03388893 | 0 |
| 693.15466302 | 0 |
| 693.27543839 | 0 |
| 693.39621505 | 0 |
| 693.51699298 | 0 |
| 693.6377722 | 0 |
| 693.75855269 | 0 |
| 693.87933446 | 0 |
| 694.00011751 | 0 |
| 694.12090182 | 0 |
| 694.24168741 | 0 |
| 694.36247427 | 0 |
| 694.48326239 | 0 |
| 694.60405178 | 0 |
| 694.72484244 | 0 |
| 694.84563436 | 0 |
| 694.96642754 | 0 |
| 695.08722199 | 0 |
| 695.20801769 | 0 |
| 695.32881465 | 0 |
| 695.44961286 | 0 |
| 695.57041233 | 0 |
| 695.69121305 | 0 |
| 695.81201502 | 0 |
| 695.93281825 | 0 |
| 696.05362272 | 0 |
| 696.17442843 | 0 |
| 696.2952354 | 0 |
| 696.4160436 | 0 |
| 696.53685305 | 0 |
| 696.65766374 | 0 |
| 696.77847566 | 0 |
| 696.89928883 | 0 |
| 697.02010323 | 0 |
| 697.14091886 | 0 |
| 697.26173573 | 0 |
| 697.38255382 | 0 |
| 697.50337315 | 0 |
| 697.6241937 | 0 |
| 697.74501549 | 0 |
| 697.86583849 | 0 |
| 697.98666272 | 0 |
| 698.10748817 | 0 |
| 698.22831485 | 0 |
| 698.34914274 | 0 |
| 698.46997184 | 0 |
| 698.59080217 | 0 |
| 698.71163371 | 0 |
| 698.83246646 | 0 |
| 698.95330042 | 0 |
| 699.07413559 | 0 |
| 699.19497197 | 0 |
| 699.31580955 | 0 |
| 699.43664834 | 0 |
| 699.55748834 | 0 |
| 699.67832953 | 0 |
| 699.79917193 | 0 |
| 699.92001552 | 0 |
| 700.04086031 | 0 |
| 700.1617063 | 0 |
| 700.28255348 | 0 |
| 700.40340185 | 0 |
| 700.52425142 | 0 |
| 700.64510217 | 0 |
| 700.76595412 | 0 |
| 700.88680724 | 0 |
| 701.00766156 | 0 |
| 701.12851705 | 0 |
| 701.24937373 | 0 |
| 701.37023159 | 0 |
| 701.49109063 | 0 |
| 701.61195084 | 0 |
| 701.73281223 | 0 |
| 701.8536748 | 0 |
| 701.97453853 | 0 |
| 702.09540344 | 0 |
| 702.21626952 | 0 |
| 702.33713676 | 0 |
| 702.45800517 | 0 |
| 702.57887475 | 0 |
| 702.69974549 | 0 |
| 702.82061739 | 0 |
| 702.94149045 | 0 |
| 703.06236467 | 0 |
| 703.18324005 | 0 |
| 703.30411658 | 0 |
| 703.42499426 | 0 |
| 703.5458731 | 0 |
| 703.66675309 | 0 |
| 703.78763423 | 0 |
| 703.90851652 | 0 |
| 704.02939995 | 0 |
| 704.15028453 | 0 |
| 704.27117025 | 0 |
| 704.39205711 | 0 |
| 704.51294511 | 0 |
| 704.63383425 | 0 |
| 704.75472453 | 0 |
| 704.87561595 | 0 |
| 704.99650849 | 0 |
| 705.11740217 | 0 |
| 705.23829698 | 0 |
| 705.35919293 | 0 |
| 705.48008999 | 0 |
| 705.60098819 | 0 |
| 705.72188751 | 0 |
| 705.84278795 | 0 |
| 705.96368951 | 0 |
| 706.0845922 | 0 |
| 706.205496 | 0 |
| 706.32640092 | 0 |
| 706.44730695 | 0 |
| 706.5682141 | 0 |
| 706.68912236 | 0 |
| 706.81003173 | 0 |
| 706.93094221 | 0 |
| 707.0518538 | 0 |
| 707.1727665 | 0 |
| 707.2936803 | 0 |
| 707.4145952 | 0 |
| 707.5355112 | 0 |
| 707.65642831 | 0 |
| 707.77734651 | 0 |
| 707.89826581 | 0 |
| 708.0191862 | 0 |
| 708.14010769 | 0 |
| 708.26103027 | 0 |
| 708.38195394 | 0 |
| 708.50287871 | 0 |
| 708.62380455 | 0 |
| 708.74473149 | 0 |
| 708.86565951 | 0 |
| 708.98658861 | 0 |
| 709.10751879 | 0 |
| 709.22845006 | 0 |
| 709.3493824 | 0 |
| 709.47031582 | 0 |
| 709.59125031 | 0 |
| 709.71218588 | 0 |
| 709.83312252 | 0 |
| 709.95406023 | 0 |
| 710.07499901 | 0 |
| 710.19593886 | 0 |
| 710.31687978 | 0 |
| 710.43782175 | 0 |
| 710.5587648 | 0 |
| 710.6797089 | 0 |
| 710.80065406 | 0 |
| 710.92160028 | 0 |
| 711.04254756 | 0 |
| 711.16349589 | 0 |
| 711.28444528 | 0 |
| 711.40539572 | 0 |
| 711.52634721 | 0 |
| 711.64729975 | 0 |
| 711.76825334 | 0 |
| 711.88920797 | 0 |
| 712.01016365 | 0 |
| 712.13112037 | 0 |
| 712.25207813 | 0 |
| 712.37303693 | 0 |
| 712.49399677 | 0 |
| 712.61495764 | 0 |
| 712.73591956 | 0 |
| 712.8568825 | 0 |
| 712.97784648 | 0 |
| 713.09881149 | 0 |
| 713.21977752 | 0 |
| 713.34074459 | 0 |
| 713.46171268 | 0 |
| 713.58268179 | 0 |
| 713.70365193 | 0 |
| 713.82462309 | 0 |
| 713.94559527 | 0 |
| 714.06656847 | 0 |
| 714.18754268 | 0 |
| 714.30851791 | 0 |
| 714.42949415 | 0 |
| 714.55047141 | 0 |
| 714.67144968 | 0 |
| 714.79242895 | 0 |
| 714.91340923 | 0 |
| 715.03439052 | 0 |
| 715.15537281 | 0 |
| 715.27635611 | 0 |
| 715.3973404 | 0 |
| 715.5183257 | 0 |
| 715.63931199 | 0 |
| 715.76029929 | 0 |
| 715.88128757 | 0 |
| 716.00227685 | 0 |
| 716.12326712 | 0 |
| 716.24425839 | 0 |
| 716.36525064 | 0 |
| 716.48624388 | 0 |
| 716.6072381 | 0 |
| 716.72823331 | 0 |
| 716.8492295 | 0 |
| 716.97022668 | 0 |
| 717.09122483 | 0 |
| 717.21222396 | 0 |
| 717.33322407 | 0 |
| 717.45422515 | 0 |
| 717.57522721 | 0 |
| 717.69623023 | 0 |
| 717.81723423 | 0 |
| 717.9382392 | 0 |
| 718.05924513 | 0 |
| 718.18025204 | 0 |
| 718.3012599 | 0 |
| 718.42226873 | 0 |
| 718.54327852 | 0 |
| 718.66428927 | 0 |
| 718.78530097 | 0 |
| 718.90631364 | 0 |
| 719.02732725 | 0 |
| 719.14834183 | 0 |
| 719.26935735 | 0 |
| 719.39037382 | 0 |
| 719.51139125 | 0 |
| 719.63240962 | 0 |
| 719.75342893 | 0 |
| 719.87444919 | 0 |
| 719.9954704 | 0 |
| 720.11649254 | 0 |
| 720.23751562 | 0 |
| 720.35853965 | 0 |
| 720.4795646 | 0 |
| 720.6005905 | 0 |
| 720.72161732 | 0 |
| 720.84264508 | 0 |
| 720.96367377 | 0 |
| 721.08470339 | 0 |
| 721.20573393 | 0 |
| 721.32676541 | 0 |
| 721.4477978 | 0 |
| 721.56883112 | 0 |
| 721.68986536 | 0 |
| 721.81090052 | 0 |
| 721.93193659 | 0 |
| 722.05297358 | 0 |
| 722.17401149 | 0 |
| 722.29505031 | 0 |
| 722.41609005 | 0 |
| 722.53713069 | 0 |
| 722.65817224 | 0 |
| 722.7792147 | 0 |
| 722.90025807 | 0 |
| 723.02130233 | 0 |
| 723.14234751 | 0 |
| 723.26339358 | 0 |
| 723.38444055 | 0 |
| 723.50548842 | 0 |
| 723.62653719 | 0 |
| 723.74758685 | 0 |
| 723.8686374 | 0 |
| 723.98968885 | 0 |
| 724.11074119 | 0 |
| 724.23179441 | 0 |
| 724.35284853 | 0 |
| 724.47390352 | 0 |
| 724.59495941 | 0 |
| 724.71601617 | 0 |
| 724.83707382 | 0 |
| 724.95813234 | 0 |
| 725.07919175 | 0 |
| 725.20025203 | 0 |
| 725.32131318 | 0 |
| 725.44237521 | 0 |
| 725.56343811 | 0 |
| 725.68450188 | 0 |
| 725.80556652 | 0 |
| 725.92663202 | 0 |
| 726.04769839 | 0 |
| 726.16876563 | 0 |
| 726.28983373 | 0 |
| 726.41090268 | 0 |
| 726.5319725 | 0 |
| 726.65304318 | 0 |
| 726.77411471 | 0 |
| 726.8951871 | 0 |
| 727.01626034 | 0 |
| 727.13733443 | 0 |
| 727.25840937 | 0 |
| 727.37948516 | 0 |
| 727.5005618 | 0 |
| 727.62163928 | 0 |
| 727.74271761 | 0 |
| 727.86379678 | 0 |
| 727.98487679 | 0 |
| 728.10595764 | 0 |
| 728.22703933 | 0 |
| 728.34812185 | 0 |
| 728.46920521 | 0 |
| 728.5902894 | 0 |
| 728.71137443 | 0 |
| 728.83246028 | 0 |
| 728.95354696 | 0 |
| 729.07463447 | 0 |
| 729.19572281 | 0 |
| 729.31681196 | 0 |
| 729.43790195 | 0 |
| 729.55899275 | 0 |
| 729.68008437 | 0 |
| 729.80117681 | 0 |
| 729.92227006 | 0 |
| 730.04336413 | 0 |
| 730.16445902 | 0 |
| 730.28555471 | 0 |
| 730.40665121 | 0 |
| 730.52774853 | 0 |
| 730.64884665 | 0 |
| 730.76994557 | 0 |
| 730.8910453 | 0 |
| 731.01214583 | 0 |
| 731.13324717 | 0 |
| 731.2543493 | 0 |
| 731.37545223 | 0 |
| 731.49655595 | 0 |
| 731.61766047 | 0 |
| 731.73876579 | 0 |
| 731.85987189 | 0 |
| 731.98097879 | 0 |
| 732.10208647 | 0 |
| 732.22319494 | 0 |
| 732.3443042 | 0 |
| 732.46541424 | 0 |
| 732.58652506 | 0 |
| 732.70763666 | 0 |
| 732.82874904 | 0 |
| 732.9498622 | 0 |
| 733.07097614 | 0 |
| 733.19209085 | 0 |
| 733.31320633 | 0 |
| 733.43432259 | 0 |
| 733.55543961 | 0 |
| 733.6765574 | 0 |
| 733.79767596 | 0 |
| 733.91879529 | 0 |
| 734.03991538 | 0 |
| 734.16103623 | 0 |
| 734.28215784 | 0 |
| 734.40328021 | 0 |
| 734.52440334 | 0 |
| 734.64552723 | 0 |
| 734.76665187 | 0 |
| 734.88777726 | 0 |
| 735.0089034 | 0 |
| 735.1300303 | 0 |
| 735.25115794 | 0 |
| 735.37228633 | 0 |
| 735.49341546 | 0 |
| 735.61454534 | 0 |
| 735.73567596 | 0 |
| 735.85680732 | 0 |
| 735.97793942 | 0 |
| 736.09907226 | 0 |
| 736.22020583 | 0 |
| 736.34134014 | 0 |
| 736.46247518 | 0 |
| 736.58361095 | 0 |
| 736.70474745 | 0 |
| 736.82588468 | 0 |
| 736.94702264 | 0 |
| 737.06816132 | 0 |
| 737.18930073 | 0 |
| 737.31044086 | 0 |
| 737.43158171 | 0 |
| 737.55272327 | 0 |
| 737.67386556 | 0 |
| 737.79500856 | 0 |
| 737.91615228 | 0 |
| 738.0372967 | 0 |
| 738.15844184 | 0 |
| 738.27958769 | 0 |
| 738.40073425 | 0 |
| 738.52188152 | 0 |
| 738.64302949 | 0 |
| 738.76417816 | 0 |
| 738.88532754 | 0 |
| 739.00647761 | 0 |
| 739.12762839 | 0 |
| 739.24877986 | 0 |
| 739.36993203 | 0 |
| 739.49108489 | 0 |
| 739.61223845 | 0 |
| 739.73339269 | 0 |
| 739.85454763 | 0 |
| 739.97570326 | 0 |
| 740.09685957 | 0 |
| 740.21801656 | 0 |
| 740.33917425 | 0 |
| 740.46033261 | 0 |
| 740.58149165 | 0 |
| 740.70265137 | 0 |
| 740.82381177 | 0 |
| 740.94497285 | 0 |
| 741.0661346 | 0 |
| 741.18729702 | 0 |
| 741.30846011 | 0 |
| 741.42962388 | 0 |
| 741.55078831 | 0 |
| 741.6719534 | 0 |
| 741.79311917 | 0 |
| 741.91428559 | 0 |
| 742.03545268 | 0 |
| 742.15662043 | 0 |
| 742.27778884 | 0 |
| 742.39895791 | 0 |
| 742.52012763 | 0 |
| 742.641298 | 0 |
| 742.76246903 | 0 |
| 742.88364071 | 0 |
| 743.00481304 | 0 |
| 743.12598602 | 0 |
| 743.24715964 | 0 |
| 743.36833391 | 0 |
| 743.48950882 | 0 |
| 743.61068437 | 0 |
| 743.73186057 | 0 |
| 743.8530374 | 0 |
| 743.97421487 | 0 |
| 744.09539298 | 0 |
| 744.21657172 | 0 |
| 744.33775109 | 0 |
| 744.4589311 | 0 |
| 744.58011173 | 0 |
| 744.70129299 | 0 |
| 744.82247488 | 0 |
| 744.9436574 | 0 |
| 745.06484053 | 0 |
| 745.18602429 | 0 |
| 745.30720867 | 0 |
| 745.42839367 | 0 |
| 745.54957929 | 0 |